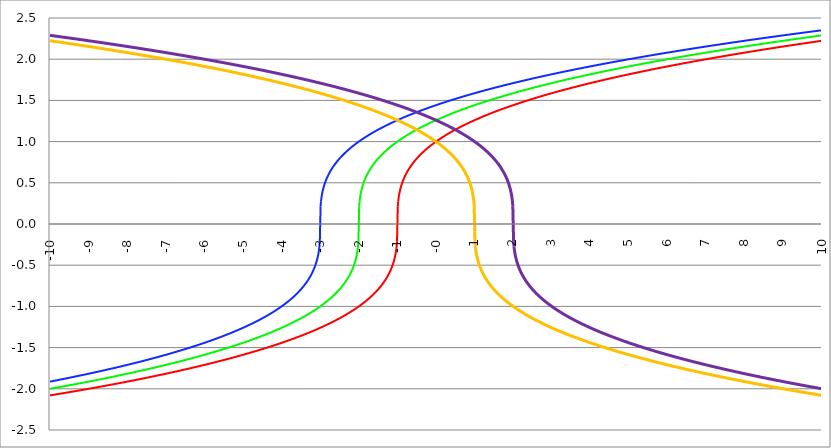
| Category | Series 1 | Series 0 | Series 2 | Series 3 | Series 4 |
|---|---|---|---|---|---|
| -10.0 | -2.08 | -2 | -1.913 | 2.224 | 2.289 |
| -9.99 | -2.079 | -1.999 | -1.912 | 2.223 | 2.289 |
| -9.98 | -2.079 | -1.998 | -1.911 | 2.223 | 2.288 |
| -9.97 | -2.078 | -1.997 | -1.91 | 2.222 | 2.288 |
| -9.96 | -2.077 | -1.997 | -1.909 | 2.221 | 2.287 |
| -9.95 | -2.076 | -1.996 | -1.908 | 2.221 | 2.286 |
| -9.940000000000001 | -2.075 | -1.995 | -1.907 | 2.22 | 2.286 |
| -9.930000000000001 | -2.075 | -1.994 | -1.907 | 2.219 | 2.285 |
| -9.920000000000002 | -2.074 | -1.993 | -1.906 | 2.219 | 2.284 |
| -9.91 | -2.073 | -1.992 | -1.905 | 2.218 | 2.284 |
| -9.900000000000002 | -2.072 | -1.992 | -1.904 | 2.217 | 2.283 |
| -9.890000000000002 | -2.072 | -1.991 | -1.903 | 2.217 | 2.282 |
| -9.880000000000003 | -2.071 | -1.99 | -1.902 | 2.216 | 2.282 |
| -9.870000000000003 | -2.07 | -1.989 | -1.901 | 2.215 | 2.281 |
| -9.860000000000001 | -2.069 | -1.988 | -1.9 | 2.215 | 2.28 |
| -9.850000000000003 | -2.068 | -1.987 | -1.899 | 2.214 | 2.28 |
| -9.840000000000003 | -2.068 | -1.987 | -1.898 | 2.213 | 2.279 |
| -9.830000000000004 | -2.067 | -1.986 | -1.897 | 2.212 | 2.279 |
| -9.820000000000004 | -2.066 | -1.985 | -1.896 | 2.212 | 2.278 |
| -9.810000000000004 | -2.065 | -1.984 | -1.895 | 2.211 | 2.277 |
| -9.800000000000004 | -2.065 | -1.983 | -1.895 | 2.21 | 2.277 |
| -9.790000000000004 | -2.064 | -1.982 | -1.894 | 2.21 | 2.276 |
| -9.780000000000005 | -2.063 | -1.981 | -1.893 | 2.209 | 2.275 |
| -9.770000000000005 | -2.062 | -1.981 | -1.892 | 2.208 | 2.275 |
| -9.760000000000005 | -2.061 | -1.98 | -1.891 | 2.208 | 2.274 |
| -9.750000000000005 | -2.061 | -1.979 | -1.89 | 2.207 | 2.273 |
| -9.740000000000006 | -2.06 | -1.978 | -1.889 | 2.206 | 2.273 |
| -9.730000000000006 | -2.059 | -1.977 | -1.888 | 2.206 | 2.272 |
| -9.720000000000006 | -2.058 | -1.976 | -1.887 | 2.205 | 2.271 |
| -9.710000000000006 | -2.057 | -1.976 | -1.886 | 2.204 | 2.271 |
| -9.700000000000006 | -2.057 | -1.975 | -1.885 | 2.204 | 2.27 |
| -9.690000000000007 | -2.056 | -1.974 | -1.884 | 2.203 | 2.27 |
| -9.680000000000007 | -2.055 | -1.973 | -1.883 | 2.202 | 2.269 |
| -9.670000000000007 | -2.054 | -1.972 | -1.882 | 2.202 | 2.268 |
| -9.660000000000007 | -2.054 | -1.971 | -1.881 | 2.201 | 2.268 |
| -9.650000000000007 | -2.053 | -1.97 | -1.881 | 2.2 | 2.267 |
| -9.640000000000008 | -2.052 | -1.97 | -1.88 | 2.199 | 2.266 |
| -9.630000000000008 | -2.051 | -1.969 | -1.879 | 2.199 | 2.266 |
| -9.620000000000008 | -2.05 | -1.968 | -1.878 | 2.198 | 2.265 |
| -9.610000000000008 | -2.05 | -1.967 | -1.877 | 2.197 | 2.264 |
| -9.600000000000009 | -2.049 | -1.966 | -1.876 | 2.197 | 2.264 |
| -9.590000000000009 | -2.048 | -1.965 | -1.875 | 2.196 | 2.263 |
| -9.580000000000007 | -2.047 | -1.964 | -1.874 | 2.195 | 2.262 |
| -9.57000000000001 | -2.046 | -1.964 | -1.873 | 2.195 | 2.262 |
| -9.56000000000001 | -2.046 | -1.963 | -1.872 | 2.194 | 2.261 |
| -9.55000000000001 | -2.045 | -1.962 | -1.871 | 2.193 | 2.26 |
| -9.54000000000001 | -2.044 | -1.961 | -1.87 | 2.193 | 2.26 |
| -9.53000000000001 | -2.043 | -1.96 | -1.869 | 2.192 | 2.259 |
| -9.52000000000001 | -2.042 | -1.959 | -1.868 | 2.191 | 2.258 |
| -9.51000000000001 | -2.042 | -1.958 | -1.867 | 2.19 | 2.258 |
| -9.50000000000001 | -2.041 | -1.957 | -1.866 | 2.19 | 2.257 |
| -9.49000000000001 | -2.04 | -1.957 | -1.865 | 2.189 | 2.257 |
| -9.48000000000001 | -2.039 | -1.956 | -1.864 | 2.188 | 2.256 |
| -9.47000000000001 | -2.038 | -1.955 | -1.863 | 2.188 | 2.255 |
| -9.46000000000001 | -2.038 | -1.954 | -1.862 | 2.187 | 2.255 |
| -9.45000000000001 | -2.037 | -1.953 | -1.861 | 2.186 | 2.254 |
| -9.44000000000001 | -2.036 | -1.952 | -1.86 | 2.186 | 2.253 |
| -9.430000000000012 | -2.035 | -1.951 | -1.86 | 2.185 | 2.253 |
| -9.420000000000012 | -2.034 | -1.95 | -1.859 | 2.184 | 2.252 |
| -9.410000000000013 | -2.034 | -1.95 | -1.858 | 2.183 | 2.251 |
| -9.400000000000013 | -2.033 | -1.949 | -1.857 | 2.183 | 2.251 |
| -9.390000000000011 | -2.032 | -1.948 | -1.856 | 2.182 | 2.25 |
| -9.380000000000013 | -2.031 | -1.947 | -1.855 | 2.181 | 2.249 |
| -9.370000000000013 | -2.03 | -1.946 | -1.854 | 2.181 | 2.249 |
| -9.360000000000014 | -2.03 | -1.945 | -1.853 | 2.18 | 2.248 |
| -9.350000000000014 | -2.029 | -1.944 | -1.852 | 2.179 | 2.247 |
| -9.340000000000014 | -2.028 | -1.943 | -1.851 | 2.179 | 2.247 |
| -9.330000000000014 | -2.027 | -1.943 | -1.85 | 2.178 | 2.246 |
| -9.320000000000014 | -2.026 | -1.942 | -1.849 | 2.177 | 2.245 |
| -9.310000000000015 | -2.026 | -1.941 | -1.848 | 2.176 | 2.245 |
| -9.300000000000013 | -2.025 | -1.94 | -1.847 | 2.176 | 2.244 |
| -9.290000000000015 | -2.024 | -1.939 | -1.846 | 2.175 | 2.243 |
| -9.280000000000015 | -2.023 | -1.938 | -1.845 | 2.174 | 2.243 |
| -9.270000000000016 | -2.022 | -1.937 | -1.844 | 2.174 | 2.242 |
| -9.260000000000016 | -2.021 | -1.936 | -1.843 | 2.173 | 2.241 |
| -9.250000000000014 | -2.021 | -1.935 | -1.842 | 2.172 | 2.241 |
| -9.240000000000016 | -2.02 | -1.935 | -1.841 | 2.172 | 2.24 |
| -9.230000000000016 | -2.019 | -1.934 | -1.84 | 2.171 | 2.239 |
| -9.220000000000017 | -2.018 | -1.933 | -1.839 | 2.17 | 2.239 |
| -9.210000000000017 | -2.017 | -1.932 | -1.838 | 2.169 | 2.238 |
| -9.200000000000017 | -2.017 | -1.931 | -1.837 | 2.169 | 2.237 |
| -9.190000000000017 | -2.016 | -1.93 | -1.836 | 2.168 | 2.237 |
| -9.180000000000017 | -2.015 | -1.929 | -1.835 | 2.167 | 2.236 |
| -9.170000000000018 | -2.014 | -1.928 | -1.834 | 2.167 | 2.235 |
| -9.160000000000016 | -2.013 | -1.927 | -1.833 | 2.166 | 2.235 |
| -9.150000000000018 | -2.012 | -1.926 | -1.832 | 2.165 | 2.234 |
| -9.140000000000018 | -2.012 | -1.926 | -1.831 | 2.164 | 2.233 |
| -9.130000000000019 | -2.011 | -1.925 | -1.83 | 2.164 | 2.233 |
| -9.120000000000019 | -2.01 | -1.924 | -1.829 | 2.163 | 2.232 |
| -9.110000000000017 | -2.009 | -1.923 | -1.828 | 2.162 | 2.231 |
| -9.10000000000002 | -2.008 | -1.922 | -1.827 | 2.162 | 2.231 |
| -9.09000000000002 | -2.007 | -1.921 | -1.826 | 2.161 | 2.23 |
| -9.08000000000002 | -2.007 | -1.92 | -1.825 | 2.16 | 2.229 |
| -9.07000000000002 | -2.006 | -1.919 | -1.824 | 2.159 | 2.229 |
| -9.06000000000002 | -2.005 | -1.918 | -1.823 | 2.159 | 2.228 |
| -9.05000000000002 | -2.004 | -1.917 | -1.822 | 2.158 | 2.227 |
| -9.04000000000002 | -2.003 | -1.917 | -1.821 | 2.157 | 2.227 |
| -9.03000000000002 | -2.002 | -1.916 | -1.82 | 2.157 | 2.226 |
| -9.020000000000021 | -2.002 | -1.915 | -1.819 | 2.156 | 2.225 |
| -9.010000000000021 | -2.001 | -1.914 | -1.818 | 2.155 | 2.225 |
| -9.000000000000021 | -2 | -1.913 | -1.817 | 2.154 | 2.224 |
| -8.990000000000022 | -1.999 | -1.912 | -1.816 | 2.154 | 2.223 |
| -8.980000000000022 | -1.998 | -1.911 | -1.815 | 2.153 | 2.223 |
| -8.97000000000002 | -1.997 | -1.91 | -1.814 | 2.152 | 2.222 |
| -8.960000000000022 | -1.997 | -1.909 | -1.813 | 2.152 | 2.221 |
| -8.950000000000022 | -1.996 | -1.908 | -1.812 | 2.151 | 2.221 |
| -8.940000000000023 | -1.995 | -1.907 | -1.811 | 2.15 | 2.22 |
| -8.930000000000023 | -1.994 | -1.907 | -1.81 | 2.149 | 2.219 |
| -8.920000000000023 | -1.993 | -1.906 | -1.809 | 2.149 | 2.219 |
| -8.910000000000023 | -1.992 | -1.905 | -1.808 | 2.148 | 2.218 |
| -8.900000000000023 | -1.992 | -1.904 | -1.807 | 2.147 | 2.217 |
| -8.890000000000024 | -1.991 | -1.903 | -1.806 | 2.147 | 2.217 |
| -8.880000000000024 | -1.99 | -1.902 | -1.805 | 2.146 | 2.216 |
| -8.870000000000024 | -1.989 | -1.901 | -1.804 | 2.145 | 2.215 |
| -8.860000000000024 | -1.988 | -1.9 | -1.803 | 2.144 | 2.215 |
| -8.850000000000025 | -1.987 | -1.899 | -1.802 | 2.144 | 2.214 |
| -8.840000000000025 | -1.987 | -1.898 | -1.801 | 2.143 | 2.213 |
| -8.830000000000025 | -1.986 | -1.897 | -1.8 | 2.142 | 2.212 |
| -8.820000000000025 | -1.985 | -1.896 | -1.799 | 2.141 | 2.212 |
| -8.810000000000025 | -1.984 | -1.895 | -1.798 | 2.141 | 2.211 |
| -8.800000000000026 | -1.983 | -1.895 | -1.797 | 2.14 | 2.21 |
| -8.790000000000026 | -1.982 | -1.894 | -1.796 | 2.139 | 2.21 |
| -8.780000000000026 | -1.981 | -1.893 | -1.795 | 2.139 | 2.209 |
| -8.770000000000026 | -1.981 | -1.892 | -1.794 | 2.138 | 2.208 |
| -8.760000000000026 | -1.98 | -1.891 | -1.793 | 2.137 | 2.208 |
| -8.750000000000027 | -1.979 | -1.89 | -1.792 | 2.136 | 2.207 |
| -8.740000000000027 | -1.978 | -1.889 | -1.79 | 2.136 | 2.206 |
| -8.730000000000027 | -1.977 | -1.888 | -1.789 | 2.135 | 2.206 |
| -8.720000000000027 | -1.976 | -1.887 | -1.788 | 2.134 | 2.205 |
| -8.710000000000027 | -1.976 | -1.886 | -1.787 | 2.133 | 2.204 |
| -8.700000000000028 | -1.975 | -1.885 | -1.786 | 2.133 | 2.204 |
| -8.690000000000028 | -1.974 | -1.884 | -1.785 | 2.132 | 2.203 |
| -8.680000000000028 | -1.973 | -1.883 | -1.784 | 2.131 | 2.202 |
| -8.670000000000028 | -1.972 | -1.882 | -1.783 | 2.13 | 2.202 |
| -8.660000000000029 | -1.971 | -1.881 | -1.782 | 2.13 | 2.201 |
| -8.650000000000029 | -1.97 | -1.881 | -1.781 | 2.129 | 2.2 |
| -8.640000000000029 | -1.97 | -1.88 | -1.78 | 2.128 | 2.199 |
| -8.63000000000003 | -1.969 | -1.879 | -1.779 | 2.128 | 2.199 |
| -8.62000000000003 | -1.968 | -1.878 | -1.778 | 2.127 | 2.198 |
| -8.61000000000003 | -1.967 | -1.877 | -1.777 | 2.126 | 2.197 |
| -8.60000000000003 | -1.966 | -1.876 | -1.776 | 2.125 | 2.197 |
| -8.59000000000003 | -1.965 | -1.875 | -1.775 | 2.125 | 2.196 |
| -8.58000000000003 | -1.964 | -1.874 | -1.774 | 2.124 | 2.195 |
| -8.57000000000003 | -1.964 | -1.873 | -1.773 | 2.123 | 2.195 |
| -8.56000000000003 | -1.963 | -1.872 | -1.772 | 2.122 | 2.194 |
| -8.55000000000003 | -1.962 | -1.871 | -1.771 | 2.122 | 2.193 |
| -8.540000000000031 | -1.961 | -1.87 | -1.769 | 2.121 | 2.193 |
| -8.530000000000031 | -1.96 | -1.869 | -1.768 | 2.12 | 2.192 |
| -8.520000000000032 | -1.959 | -1.868 | -1.767 | 2.119 | 2.191 |
| -8.510000000000032 | -1.958 | -1.867 | -1.766 | 2.119 | 2.19 |
| -8.50000000000003 | -1.957 | -1.866 | -1.765 | 2.118 | 2.19 |
| -8.490000000000032 | -1.957 | -1.865 | -1.764 | 2.117 | 2.189 |
| -8.480000000000032 | -1.956 | -1.864 | -1.763 | 2.116 | 2.188 |
| -8.470000000000033 | -1.955 | -1.863 | -1.762 | 2.116 | 2.188 |
| -8.460000000000033 | -1.954 | -1.862 | -1.761 | 2.115 | 2.187 |
| -8.450000000000033 | -1.953 | -1.861 | -1.76 | 2.114 | 2.186 |
| -8.440000000000033 | -1.952 | -1.86 | -1.759 | 2.113 | 2.186 |
| -8.430000000000033 | -1.951 | -1.86 | -1.758 | 2.113 | 2.185 |
| -8.420000000000034 | -1.95 | -1.859 | -1.757 | 2.112 | 2.184 |
| -8.410000000000032 | -1.95 | -1.858 | -1.755 | 2.111 | 2.183 |
| -8.400000000000034 | -1.949 | -1.857 | -1.754 | 2.11 | 2.183 |
| -8.390000000000034 | -1.948 | -1.856 | -1.753 | 2.11 | 2.182 |
| -8.380000000000035 | -1.947 | -1.855 | -1.752 | 2.109 | 2.181 |
| -8.370000000000035 | -1.946 | -1.854 | -1.751 | 2.108 | 2.181 |
| -8.360000000000033 | -1.945 | -1.853 | -1.75 | 2.107 | 2.18 |
| -8.350000000000035 | -1.944 | -1.852 | -1.749 | 2.107 | 2.179 |
| -8.340000000000035 | -1.943 | -1.851 | -1.748 | 2.106 | 2.179 |
| -8.330000000000036 | -1.943 | -1.85 | -1.747 | 2.105 | 2.178 |
| -8.320000000000036 | -1.942 | -1.849 | -1.746 | 2.104 | 2.177 |
| -8.310000000000034 | -1.941 | -1.848 | -1.745 | 2.104 | 2.176 |
| -8.300000000000036 | -1.94 | -1.847 | -1.744 | 2.103 | 2.176 |
| -8.290000000000036 | -1.939 | -1.846 | -1.742 | 2.102 | 2.175 |
| -8.280000000000037 | -1.938 | -1.845 | -1.741 | 2.101 | 2.174 |
| -8.270000000000037 | -1.937 | -1.844 | -1.74 | 2.101 | 2.174 |
| -8.260000000000037 | -1.936 | -1.843 | -1.739 | 2.1 | 2.173 |
| -8.250000000000037 | -1.935 | -1.842 | -1.738 | 2.099 | 2.172 |
| -8.240000000000038 | -1.935 | -1.841 | -1.737 | 2.098 | 2.172 |
| -8.230000000000038 | -1.934 | -1.84 | -1.736 | 2.098 | 2.171 |
| -8.220000000000038 | -1.933 | -1.839 | -1.735 | 2.097 | 2.17 |
| -8.210000000000038 | -1.932 | -1.838 | -1.734 | 2.096 | 2.169 |
| -8.200000000000038 | -1.931 | -1.837 | -1.732 | 2.095 | 2.169 |
| -8.190000000000039 | -1.93 | -1.836 | -1.731 | 2.095 | 2.168 |
| -8.180000000000039 | -1.929 | -1.835 | -1.73 | 2.094 | 2.167 |
| -8.170000000000037 | -1.928 | -1.834 | -1.729 | 2.093 | 2.167 |
| -8.16000000000004 | -1.927 | -1.833 | -1.728 | 2.092 | 2.166 |
| -8.15000000000004 | -1.926 | -1.832 | -1.727 | 2.092 | 2.165 |
| -8.14000000000004 | -1.926 | -1.831 | -1.726 | 2.091 | 2.164 |
| -8.13000000000004 | -1.925 | -1.83 | -1.725 | 2.09 | 2.164 |
| -8.12000000000004 | -1.924 | -1.829 | -1.724 | 2.089 | 2.163 |
| -8.11000000000004 | -1.923 | -1.828 | -1.722 | 2.089 | 2.162 |
| -8.10000000000004 | -1.922 | -1.827 | -1.721 | 2.088 | 2.162 |
| -8.09000000000004 | -1.921 | -1.826 | -1.72 | 2.087 | 2.161 |
| -8.08000000000004 | -1.92 | -1.825 | -1.719 | 2.086 | 2.16 |
| -8.07000000000004 | -1.919 | -1.824 | -1.718 | 2.085 | 2.159 |
| -8.06000000000004 | -1.918 | -1.823 | -1.717 | 2.085 | 2.159 |
| -8.05000000000004 | -1.917 | -1.822 | -1.716 | 2.084 | 2.158 |
| -8.040000000000042 | -1.917 | -1.821 | -1.715 | 2.083 | 2.157 |
| -8.03000000000004 | -1.916 | -1.82 | -1.713 | 2.082 | 2.157 |
| -8.020000000000042 | -1.915 | -1.819 | -1.712 | 2.082 | 2.156 |
| -8.010000000000042 | -1.914 | -1.818 | -1.711 | 2.081 | 2.155 |
| -8.000000000000043 | -1.913 | -1.817 | -1.71 | 2.08 | 2.154 |
| -7.990000000000043 | -1.912 | -1.816 | -1.709 | 2.079 | 2.154 |
| -7.980000000000043 | -1.911 | -1.815 | -1.708 | 2.079 | 2.153 |
| -7.970000000000043 | -1.91 | -1.814 | -1.707 | 2.078 | 2.152 |
| -7.960000000000043 | -1.909 | -1.813 | -1.705 | 2.077 | 2.152 |
| -7.950000000000044 | -1.908 | -1.812 | -1.704 | 2.076 | 2.151 |
| -7.940000000000044 | -1.907 | -1.811 | -1.703 | 2.075 | 2.15 |
| -7.930000000000044 | -1.907 | -1.81 | -1.702 | 2.075 | 2.149 |
| -7.920000000000044 | -1.906 | -1.809 | -1.701 | 2.074 | 2.149 |
| -7.910000000000044 | -1.905 | -1.808 | -1.7 | 2.073 | 2.148 |
| -7.900000000000044 | -1.904 | -1.807 | -1.698 | 2.072 | 2.147 |
| -7.890000000000045 | -1.903 | -1.806 | -1.697 | 2.072 | 2.147 |
| -7.880000000000045 | -1.902 | -1.805 | -1.696 | 2.071 | 2.146 |
| -7.870000000000045 | -1.901 | -1.804 | -1.695 | 2.07 | 2.145 |
| -7.860000000000046 | -1.9 | -1.803 | -1.694 | 2.069 | 2.144 |
| -7.850000000000046 | -1.899 | -1.802 | -1.693 | 2.068 | 2.144 |
| -7.840000000000046 | -1.898 | -1.801 | -1.692 | 2.068 | 2.143 |
| -7.830000000000046 | -1.897 | -1.8 | -1.69 | 2.067 | 2.142 |
| -7.820000000000046 | -1.896 | -1.799 | -1.689 | 2.066 | 2.141 |
| -7.810000000000047 | -1.895 | -1.798 | -1.688 | 2.065 | 2.141 |
| -7.800000000000047 | -1.895 | -1.797 | -1.687 | 2.065 | 2.14 |
| -7.790000000000047 | -1.894 | -1.796 | -1.686 | 2.064 | 2.139 |
| -7.780000000000047 | -1.893 | -1.795 | -1.685 | 2.063 | 2.139 |
| -7.770000000000047 | -1.892 | -1.794 | -1.683 | 2.062 | 2.138 |
| -7.760000000000048 | -1.891 | -1.793 | -1.682 | 2.061 | 2.137 |
| -7.750000000000048 | -1.89 | -1.792 | -1.681 | 2.061 | 2.136 |
| -7.740000000000048 | -1.889 | -1.79 | -1.68 | 2.06 | 2.136 |
| -7.730000000000048 | -1.888 | -1.789 | -1.679 | 2.059 | 2.135 |
| -7.720000000000049 | -1.887 | -1.788 | -1.677 | 2.058 | 2.134 |
| -7.710000000000049 | -1.886 | -1.787 | -1.676 | 2.057 | 2.133 |
| -7.700000000000049 | -1.885 | -1.786 | -1.675 | 2.057 | 2.133 |
| -7.690000000000049 | -1.884 | -1.785 | -1.674 | 2.056 | 2.132 |
| -7.680000000000049 | -1.883 | -1.784 | -1.673 | 2.055 | 2.131 |
| -7.67000000000005 | -1.882 | -1.783 | -1.671 | 2.054 | 2.13 |
| -7.66000000000005 | -1.881 | -1.782 | -1.67 | 2.054 | 2.13 |
| -7.65000000000005 | -1.881 | -1.781 | -1.669 | 2.053 | 2.129 |
| -7.64000000000005 | -1.88 | -1.78 | -1.668 | 2.052 | 2.128 |
| -7.63000000000005 | -1.879 | -1.779 | -1.667 | 2.051 | 2.128 |
| -7.620000000000051 | -1.878 | -1.778 | -1.666 | 2.05 | 2.127 |
| -7.610000000000051 | -1.877 | -1.777 | -1.664 | 2.05 | 2.126 |
| -7.600000000000051 | -1.876 | -1.776 | -1.663 | 2.049 | 2.125 |
| -7.590000000000051 | -1.875 | -1.775 | -1.662 | 2.048 | 2.125 |
| -7.580000000000052 | -1.874 | -1.774 | -1.661 | 2.047 | 2.124 |
| -7.570000000000052 | -1.873 | -1.773 | -1.659 | 2.046 | 2.123 |
| -7.560000000000052 | -1.872 | -1.772 | -1.658 | 2.046 | 2.122 |
| -7.550000000000052 | -1.871 | -1.771 | -1.657 | 2.045 | 2.122 |
| -7.540000000000052 | -1.87 | -1.769 | -1.656 | 2.044 | 2.121 |
| -7.530000000000053 | -1.869 | -1.768 | -1.655 | 2.043 | 2.12 |
| -7.520000000000053 | -1.868 | -1.767 | -1.653 | 2.042 | 2.119 |
| -7.510000000000053 | -1.867 | -1.766 | -1.652 | 2.042 | 2.119 |
| -7.500000000000053 | -1.866 | -1.765 | -1.651 | 2.041 | 2.118 |
| -7.490000000000053 | -1.865 | -1.764 | -1.65 | 2.04 | 2.117 |
| -7.480000000000054 | -1.864 | -1.763 | -1.649 | 2.039 | 2.116 |
| -7.470000000000054 | -1.863 | -1.762 | -1.647 | 2.038 | 2.116 |
| -7.460000000000054 | -1.862 | -1.761 | -1.646 | 2.038 | 2.115 |
| -7.450000000000054 | -1.861 | -1.76 | -1.645 | 2.037 | 2.114 |
| -7.440000000000054 | -1.86 | -1.759 | -1.644 | 2.036 | 2.113 |
| -7.430000000000054 | -1.86 | -1.758 | -1.642 | 2.035 | 2.113 |
| -7.420000000000055 | -1.859 | -1.757 | -1.641 | 2.034 | 2.112 |
| -7.410000000000055 | -1.858 | -1.755 | -1.64 | 2.034 | 2.111 |
| -7.400000000000055 | -1.857 | -1.754 | -1.639 | 2.033 | 2.11 |
| -7.390000000000056 | -1.856 | -1.753 | -1.637 | 2.032 | 2.11 |
| -7.380000000000056 | -1.855 | -1.752 | -1.636 | 2.031 | 2.109 |
| -7.370000000000056 | -1.854 | -1.751 | -1.635 | 2.03 | 2.108 |
| -7.360000000000056 | -1.853 | -1.75 | -1.634 | 2.03 | 2.107 |
| -7.350000000000056 | -1.852 | -1.749 | -1.632 | 2.029 | 2.107 |
| -7.340000000000057 | -1.851 | -1.748 | -1.631 | 2.028 | 2.106 |
| -7.330000000000057 | -1.85 | -1.747 | -1.63 | 2.027 | 2.105 |
| -7.320000000000057 | -1.849 | -1.746 | -1.629 | 2.026 | 2.104 |
| -7.310000000000057 | -1.848 | -1.745 | -1.627 | 2.026 | 2.104 |
| -7.300000000000058 | -1.847 | -1.744 | -1.626 | 2.025 | 2.103 |
| -7.290000000000058 | -1.846 | -1.742 | -1.625 | 2.024 | 2.102 |
| -7.280000000000058 | -1.845 | -1.741 | -1.624 | 2.023 | 2.101 |
| -7.270000000000058 | -1.844 | -1.74 | -1.622 | 2.022 | 2.101 |
| -7.260000000000058 | -1.843 | -1.739 | -1.621 | 2.021 | 2.1 |
| -7.250000000000059 | -1.842 | -1.738 | -1.62 | 2.021 | 2.099 |
| -7.240000000000059 | -1.841 | -1.737 | -1.619 | 2.02 | 2.098 |
| -7.23000000000006 | -1.84 | -1.736 | -1.617 | 2.019 | 2.098 |
| -7.220000000000059 | -1.839 | -1.735 | -1.616 | 2.018 | 2.097 |
| -7.210000000000059 | -1.838 | -1.734 | -1.615 | 2.017 | 2.096 |
| -7.20000000000006 | -1.837 | -1.732 | -1.613 | 2.017 | 2.095 |
| -7.19000000000006 | -1.836 | -1.731 | -1.612 | 2.016 | 2.095 |
| -7.18000000000006 | -1.835 | -1.73 | -1.611 | 2.015 | 2.094 |
| -7.17000000000006 | -1.834 | -1.729 | -1.61 | 2.014 | 2.093 |
| -7.160000000000061 | -1.833 | -1.728 | -1.608 | 2.013 | 2.092 |
| -7.150000000000061 | -1.832 | -1.727 | -1.607 | 2.012 | 2.092 |
| -7.140000000000061 | -1.831 | -1.726 | -1.606 | 2.012 | 2.091 |
| -7.130000000000061 | -1.83 | -1.725 | -1.604 | 2.011 | 2.09 |
| -7.120000000000061 | -1.829 | -1.724 | -1.603 | 2.01 | 2.089 |
| -7.110000000000062 | -1.828 | -1.722 | -1.602 | 2.009 | 2.089 |
| -7.100000000000062 | -1.827 | -1.721 | -1.601 | 2.008 | 2.088 |
| -7.090000000000062 | -1.826 | -1.72 | -1.599 | 2.007 | 2.087 |
| -7.080000000000062 | -1.825 | -1.719 | -1.598 | 2.007 | 2.086 |
| -7.070000000000062 | -1.824 | -1.718 | -1.597 | 2.006 | 2.085 |
| -7.060000000000063 | -1.823 | -1.717 | -1.595 | 2.005 | 2.085 |
| -7.050000000000063 | -1.822 | -1.716 | -1.594 | 2.004 | 2.084 |
| -7.040000000000063 | -1.821 | -1.715 | -1.593 | 2.003 | 2.083 |
| -7.030000000000063 | -1.82 | -1.713 | -1.591 | 2.002 | 2.082 |
| -7.020000000000064 | -1.819 | -1.712 | -1.59 | 2.002 | 2.082 |
| -7.010000000000064 | -1.818 | -1.711 | -1.589 | 2.001 | 2.081 |
| -7.000000000000064 | -1.817 | -1.71 | -1.587 | 2 | 2.08 |
| -6.990000000000064 | -1.816 | -1.709 | -1.586 | 1.999 | 2.079 |
| -6.980000000000064 | -1.815 | -1.708 | -1.585 | 1.998 | 2.079 |
| -6.970000000000064 | -1.814 | -1.707 | -1.583 | 1.997 | 2.078 |
| -6.960000000000064 | -1.813 | -1.705 | -1.582 | 1.997 | 2.077 |
| -6.950000000000064 | -1.812 | -1.704 | -1.581 | 1.996 | 2.076 |
| -6.940000000000065 | -1.811 | -1.703 | -1.579 | 1.995 | 2.075 |
| -6.930000000000065 | -1.81 | -1.702 | -1.578 | 1.994 | 2.075 |
| -6.920000000000065 | -1.809 | -1.701 | -1.577 | 1.993 | 2.074 |
| -6.910000000000065 | -1.808 | -1.7 | -1.575 | 1.992 | 2.073 |
| -6.900000000000066 | -1.807 | -1.698 | -1.574 | 1.992 | 2.072 |
| -6.890000000000066 | -1.806 | -1.697 | -1.573 | 1.991 | 2.072 |
| -6.880000000000066 | -1.805 | -1.696 | -1.571 | 1.99 | 2.071 |
| -6.870000000000066 | -1.804 | -1.695 | -1.57 | 1.989 | 2.07 |
| -6.860000000000067 | -1.803 | -1.694 | -1.569 | 1.988 | 2.069 |
| -6.850000000000067 | -1.802 | -1.693 | -1.567 | 1.987 | 2.068 |
| -6.840000000000067 | -1.801 | -1.692 | -1.566 | 1.987 | 2.068 |
| -6.830000000000067 | -1.8 | -1.69 | -1.565 | 1.986 | 2.067 |
| -6.820000000000068 | -1.799 | -1.689 | -1.563 | 1.985 | 2.066 |
| -6.810000000000068 | -1.798 | -1.688 | -1.562 | 1.984 | 2.065 |
| -6.800000000000068 | -1.797 | -1.687 | -1.56 | 1.983 | 2.065 |
| -6.790000000000068 | -1.796 | -1.686 | -1.559 | 1.982 | 2.064 |
| -6.780000000000068 | -1.795 | -1.685 | -1.558 | 1.981 | 2.063 |
| -6.770000000000068 | -1.794 | -1.683 | -1.556 | 1.981 | 2.062 |
| -6.760000000000069 | -1.793 | -1.682 | -1.555 | 1.98 | 2.061 |
| -6.75000000000007 | -1.792 | -1.681 | -1.554 | 1.979 | 2.061 |
| -6.74000000000007 | -1.79 | -1.68 | -1.552 | 1.978 | 2.06 |
| -6.73000000000007 | -1.789 | -1.679 | -1.551 | 1.977 | 2.059 |
| -6.72000000000007 | -1.788 | -1.677 | -1.549 | 1.976 | 2.058 |
| -6.71000000000007 | -1.787 | -1.676 | -1.548 | 1.976 | 2.057 |
| -6.70000000000007 | -1.786 | -1.675 | -1.547 | 1.975 | 2.057 |
| -6.69000000000007 | -1.785 | -1.674 | -1.545 | 1.974 | 2.056 |
| -6.680000000000071 | -1.784 | -1.673 | -1.544 | 1.973 | 2.055 |
| -6.670000000000071 | -1.783 | -1.671 | -1.542 | 1.972 | 2.054 |
| -6.660000000000071 | -1.782 | -1.67 | -1.541 | 1.971 | 2.054 |
| -6.650000000000071 | -1.781 | -1.669 | -1.54 | 1.97 | 2.053 |
| -6.640000000000072 | -1.78 | -1.668 | -1.538 | 1.97 | 2.052 |
| -6.630000000000072 | -1.779 | -1.667 | -1.537 | 1.969 | 2.051 |
| -6.620000000000072 | -1.778 | -1.666 | -1.535 | 1.968 | 2.05 |
| -6.610000000000072 | -1.777 | -1.664 | -1.534 | 1.967 | 2.05 |
| -6.600000000000072 | -1.776 | -1.663 | -1.533 | 1.966 | 2.049 |
| -6.590000000000073 | -1.775 | -1.662 | -1.531 | 1.965 | 2.048 |
| -6.580000000000073 | -1.774 | -1.661 | -1.53 | 1.964 | 2.047 |
| -6.570000000000073 | -1.773 | -1.659 | -1.528 | 1.964 | 2.046 |
| -6.560000000000073 | -1.772 | -1.658 | -1.527 | 1.963 | 2.046 |
| -6.550000000000074 | -1.771 | -1.657 | -1.525 | 1.962 | 2.045 |
| -6.540000000000074 | -1.769 | -1.656 | -1.524 | 1.961 | 2.044 |
| -6.530000000000074 | -1.768 | -1.655 | -1.523 | 1.96 | 2.043 |
| -6.520000000000074 | -1.767 | -1.653 | -1.521 | 1.959 | 2.042 |
| -6.510000000000074 | -1.766 | -1.652 | -1.52 | 1.958 | 2.042 |
| -6.500000000000074 | -1.765 | -1.651 | -1.518 | 1.957 | 2.041 |
| -6.490000000000074 | -1.764 | -1.65 | -1.517 | 1.957 | 2.04 |
| -6.480000000000074 | -1.763 | -1.649 | -1.515 | 1.956 | 2.039 |
| -6.470000000000075 | -1.762 | -1.647 | -1.514 | 1.955 | 2.038 |
| -6.460000000000075 | -1.761 | -1.646 | -1.512 | 1.954 | 2.038 |
| -6.450000000000075 | -1.76 | -1.645 | -1.511 | 1.953 | 2.037 |
| -6.440000000000075 | -1.759 | -1.644 | -1.51 | 1.952 | 2.036 |
| -6.430000000000076 | -1.758 | -1.642 | -1.508 | 1.951 | 2.035 |
| -6.420000000000076 | -1.757 | -1.641 | -1.507 | 1.95 | 2.034 |
| -6.410000000000076 | -1.755 | -1.64 | -1.505 | 1.95 | 2.034 |
| -6.400000000000076 | -1.754 | -1.639 | -1.504 | 1.949 | 2.033 |
| -6.390000000000077 | -1.753 | -1.637 | -1.502 | 1.948 | 2.032 |
| -6.380000000000077 | -1.752 | -1.636 | -1.501 | 1.947 | 2.031 |
| -6.370000000000077 | -1.751 | -1.635 | -1.499 | 1.946 | 2.03 |
| -6.360000000000078 | -1.75 | -1.634 | -1.498 | 1.945 | 2.03 |
| -6.350000000000078 | -1.749 | -1.632 | -1.496 | 1.944 | 2.029 |
| -6.340000000000078 | -1.748 | -1.631 | -1.495 | 1.943 | 2.028 |
| -6.330000000000078 | -1.747 | -1.63 | -1.493 | 1.943 | 2.027 |
| -6.320000000000078 | -1.746 | -1.629 | -1.492 | 1.942 | 2.026 |
| -6.310000000000079 | -1.745 | -1.627 | -1.49 | 1.941 | 2.026 |
| -6.300000000000079 | -1.744 | -1.626 | -1.489 | 1.94 | 2.025 |
| -6.29000000000008 | -1.742 | -1.625 | -1.487 | 1.939 | 2.024 |
| -6.28000000000008 | -1.741 | -1.624 | -1.486 | 1.938 | 2.023 |
| -6.27000000000008 | -1.74 | -1.622 | -1.484 | 1.937 | 2.022 |
| -6.26000000000008 | -1.739 | -1.621 | -1.483 | 1.936 | 2.021 |
| -6.25000000000008 | -1.738 | -1.62 | -1.481 | 1.935 | 2.021 |
| -6.24000000000008 | -1.737 | -1.619 | -1.48 | 1.935 | 2.02 |
| -6.23000000000008 | -1.736 | -1.617 | -1.478 | 1.934 | 2.019 |
| -6.220000000000081 | -1.735 | -1.616 | -1.477 | 1.933 | 2.018 |
| -6.210000000000081 | -1.734 | -1.615 | -1.475 | 1.932 | 2.017 |
| -6.200000000000081 | -1.732 | -1.613 | -1.474 | 1.931 | 2.017 |
| -6.190000000000081 | -1.731 | -1.612 | -1.472 | 1.93 | 2.016 |
| -6.180000000000081 | -1.73 | -1.611 | -1.471 | 1.929 | 2.015 |
| -6.170000000000082 | -1.729 | -1.61 | -1.469 | 1.928 | 2.014 |
| -6.160000000000082 | -1.728 | -1.608 | -1.467 | 1.927 | 2.013 |
| -6.150000000000082 | -1.727 | -1.607 | -1.466 | 1.926 | 2.012 |
| -6.140000000000082 | -1.726 | -1.606 | -1.464 | 1.926 | 2.012 |
| -6.130000000000082 | -1.725 | -1.604 | -1.463 | 1.925 | 2.011 |
| -6.120000000000083 | -1.724 | -1.603 | -1.461 | 1.924 | 2.01 |
| -6.110000000000083 | -1.722 | -1.602 | -1.46 | 1.923 | 2.009 |
| -6.100000000000083 | -1.721 | -1.601 | -1.458 | 1.922 | 2.008 |
| -6.090000000000083 | -1.72 | -1.599 | -1.457 | 1.921 | 2.007 |
| -6.080000000000084 | -1.719 | -1.598 | -1.455 | 1.92 | 2.007 |
| -6.070000000000084 | -1.718 | -1.597 | -1.453 | 1.919 | 2.006 |
| -6.060000000000084 | -1.717 | -1.595 | -1.452 | 1.918 | 2.005 |
| -6.050000000000084 | -1.716 | -1.594 | -1.45 | 1.917 | 2.004 |
| -6.040000000000084 | -1.715 | -1.593 | -1.449 | 1.917 | 2.003 |
| -6.030000000000084 | -1.713 | -1.591 | -1.447 | 1.916 | 2.002 |
| -6.020000000000085 | -1.712 | -1.59 | -1.445 | 1.915 | 2.002 |
| -6.010000000000085 | -1.711 | -1.589 | -1.444 | 1.914 | 2.001 |
| -6.000000000000085 | -1.71 | -1.587 | -1.442 | 1.913 | 2 |
| -5.990000000000085 | -1.709 | -1.586 | -1.441 | 1.912 | 1.999 |
| -5.980000000000085 | -1.708 | -1.585 | -1.439 | 1.911 | 1.998 |
| -5.970000000000085 | -1.707 | -1.583 | -1.437 | 1.91 | 1.997 |
| -5.960000000000086 | -1.705 | -1.582 | -1.436 | 1.909 | 1.997 |
| -5.950000000000086 | -1.704 | -1.581 | -1.434 | 1.908 | 1.996 |
| -5.940000000000086 | -1.703 | -1.579 | -1.433 | 1.907 | 1.995 |
| -5.930000000000086 | -1.702 | -1.578 | -1.431 | 1.907 | 1.994 |
| -5.920000000000087 | -1.701 | -1.577 | -1.429 | 1.906 | 1.993 |
| -5.910000000000087 | -1.7 | -1.575 | -1.428 | 1.905 | 1.992 |
| -5.900000000000087 | -1.698 | -1.574 | -1.426 | 1.904 | 1.992 |
| -5.890000000000088 | -1.697 | -1.573 | -1.424 | 1.903 | 1.991 |
| -5.880000000000088 | -1.696 | -1.571 | -1.423 | 1.902 | 1.99 |
| -5.870000000000088 | -1.695 | -1.57 | -1.421 | 1.901 | 1.989 |
| -5.860000000000088 | -1.694 | -1.569 | -1.419 | 1.9 | 1.988 |
| -5.850000000000088 | -1.693 | -1.567 | -1.418 | 1.899 | 1.987 |
| -5.840000000000089 | -1.692 | -1.566 | -1.416 | 1.898 | 1.987 |
| -5.830000000000089 | -1.69 | -1.565 | -1.414 | 1.897 | 1.986 |
| -5.820000000000089 | -1.689 | -1.563 | -1.413 | 1.896 | 1.985 |
| -5.810000000000089 | -1.688 | -1.562 | -1.411 | 1.895 | 1.984 |
| -5.800000000000089 | -1.687 | -1.56 | -1.409 | 1.895 | 1.983 |
| -5.79000000000009 | -1.686 | -1.559 | -1.408 | 1.894 | 1.982 |
| -5.78000000000009 | -1.685 | -1.558 | -1.406 | 1.893 | 1.981 |
| -5.77000000000009 | -1.683 | -1.556 | -1.404 | 1.892 | 1.981 |
| -5.76000000000009 | -1.682 | -1.555 | -1.403 | 1.891 | 1.98 |
| -5.750000000000091 | -1.681 | -1.554 | -1.401 | 1.89 | 1.979 |
| -5.740000000000091 | -1.68 | -1.552 | -1.399 | 1.889 | 1.978 |
| -5.730000000000091 | -1.679 | -1.551 | -1.398 | 1.888 | 1.977 |
| -5.720000000000091 | -1.677 | -1.549 | -1.396 | 1.887 | 1.976 |
| -5.710000000000091 | -1.676 | -1.548 | -1.394 | 1.886 | 1.976 |
| -5.700000000000092 | -1.675 | -1.547 | -1.392 | 1.885 | 1.975 |
| -5.690000000000092 | -1.674 | -1.545 | -1.391 | 1.884 | 1.974 |
| -5.680000000000092 | -1.673 | -1.544 | -1.389 | 1.883 | 1.973 |
| -5.670000000000092 | -1.671 | -1.542 | -1.387 | 1.882 | 1.972 |
| -5.660000000000092 | -1.67 | -1.541 | -1.386 | 1.881 | 1.971 |
| -5.650000000000093 | -1.669 | -1.54 | -1.384 | 1.881 | 1.97 |
| -5.640000000000093 | -1.668 | -1.538 | -1.382 | 1.88 | 1.97 |
| -5.630000000000093 | -1.667 | -1.537 | -1.38 | 1.879 | 1.969 |
| -5.620000000000093 | -1.666 | -1.535 | -1.379 | 1.878 | 1.968 |
| -5.610000000000093 | -1.664 | -1.534 | -1.377 | 1.877 | 1.967 |
| -5.600000000000094 | -1.663 | -1.533 | -1.375 | 1.876 | 1.966 |
| -5.590000000000094 | -1.662 | -1.531 | -1.373 | 1.875 | 1.965 |
| -5.580000000000094 | -1.661 | -1.53 | -1.372 | 1.874 | 1.964 |
| -5.570000000000094 | -1.659 | -1.528 | -1.37 | 1.873 | 1.964 |
| -5.560000000000095 | -1.658 | -1.527 | -1.368 | 1.872 | 1.963 |
| -5.550000000000095 | -1.657 | -1.525 | -1.366 | 1.871 | 1.962 |
| -5.540000000000095 | -1.656 | -1.524 | -1.364 | 1.87 | 1.961 |
| -5.530000000000095 | -1.655 | -1.523 | -1.363 | 1.869 | 1.96 |
| -5.520000000000095 | -1.653 | -1.521 | -1.361 | 1.868 | 1.959 |
| -5.510000000000096 | -1.652 | -1.52 | -1.359 | 1.867 | 1.958 |
| -5.500000000000096 | -1.651 | -1.518 | -1.357 | 1.866 | 1.957 |
| -5.490000000000096 | -1.65 | -1.517 | -1.355 | 1.865 | 1.957 |
| -5.480000000000096 | -1.649 | -1.515 | -1.354 | 1.864 | 1.956 |
| -5.470000000000096 | -1.647 | -1.514 | -1.352 | 1.863 | 1.955 |
| -5.460000000000097 | -1.646 | -1.512 | -1.35 | 1.862 | 1.954 |
| -5.450000000000097 | -1.645 | -1.511 | -1.348 | 1.861 | 1.953 |
| -5.440000000000097 | -1.644 | -1.51 | -1.346 | 1.86 | 1.952 |
| -5.430000000000097 | -1.642 | -1.508 | -1.344 | 1.86 | 1.951 |
| -5.420000000000098 | -1.641 | -1.507 | -1.343 | 1.859 | 1.95 |
| -5.410000000000098 | -1.64 | -1.505 | -1.341 | 1.858 | 1.95 |
| -5.400000000000098 | -1.639 | -1.504 | -1.339 | 1.857 | 1.949 |
| -5.390000000000098 | -1.637 | -1.502 | -1.337 | 1.856 | 1.948 |
| -5.380000000000098 | -1.636 | -1.501 | -1.335 | 1.855 | 1.947 |
| -5.370000000000099 | -1.635 | -1.499 | -1.333 | 1.854 | 1.946 |
| -5.360000000000099 | -1.634 | -1.498 | -1.331 | 1.853 | 1.945 |
| -5.350000000000099 | -1.632 | -1.496 | -1.33 | 1.852 | 1.944 |
| -5.340000000000099 | -1.631 | -1.495 | -1.328 | 1.851 | 1.943 |
| -5.330000000000099 | -1.63 | -1.493 | -1.326 | 1.85 | 1.943 |
| -5.3200000000001 | -1.629 | -1.492 | -1.324 | 1.849 | 1.942 |
| -5.3100000000001 | -1.627 | -1.49 | -1.322 | 1.848 | 1.941 |
| -5.3000000000001 | -1.626 | -1.489 | -1.32 | 1.847 | 1.94 |
| -5.2900000000001 | -1.625 | -1.487 | -1.318 | 1.846 | 1.939 |
| -5.2800000000001 | -1.624 | -1.486 | -1.316 | 1.845 | 1.938 |
| -5.2700000000001 | -1.622 | -1.484 | -1.314 | 1.844 | 1.937 |
| -5.260000000000101 | -1.621 | -1.483 | -1.312 | 1.843 | 1.936 |
| -5.250000000000101 | -1.62 | -1.481 | -1.31 | 1.842 | 1.935 |
| -5.240000000000101 | -1.619 | -1.48 | -1.308 | 1.841 | 1.935 |
| -5.230000000000101 | -1.617 | -1.478 | -1.306 | 1.84 | 1.934 |
| -5.220000000000102 | -1.616 | -1.477 | -1.305 | 1.839 | 1.933 |
| -5.210000000000102 | -1.615 | -1.475 | -1.303 | 1.838 | 1.932 |
| -5.200000000000102 | -1.613 | -1.474 | -1.301 | 1.837 | 1.931 |
| -5.190000000000103 | -1.612 | -1.472 | -1.299 | 1.836 | 1.93 |
| -5.180000000000103 | -1.611 | -1.471 | -1.297 | 1.835 | 1.929 |
| -5.170000000000103 | -1.61 | -1.469 | -1.295 | 1.834 | 1.928 |
| -5.160000000000103 | -1.608 | -1.467 | -1.293 | 1.833 | 1.927 |
| -5.150000000000103 | -1.607 | -1.466 | -1.291 | 1.832 | 1.926 |
| -5.140000000000104 | -1.606 | -1.464 | -1.289 | 1.831 | 1.926 |
| -5.130000000000104 | -1.604 | -1.463 | -1.287 | 1.83 | 1.925 |
| -5.120000000000104 | -1.603 | -1.461 | -1.285 | 1.829 | 1.924 |
| -5.110000000000104 | -1.602 | -1.46 | -1.283 | 1.828 | 1.923 |
| -5.100000000000104 | -1.601 | -1.458 | -1.281 | 1.827 | 1.922 |
| -5.090000000000104 | -1.599 | -1.457 | -1.279 | 1.826 | 1.921 |
| -5.080000000000104 | -1.598 | -1.455 | -1.277 | 1.825 | 1.92 |
| -5.070000000000105 | -1.597 | -1.453 | -1.274 | 1.824 | 1.919 |
| -5.060000000000105 | -1.595 | -1.452 | -1.272 | 1.823 | 1.918 |
| -5.050000000000105 | -1.594 | -1.45 | -1.27 | 1.822 | 1.917 |
| -5.040000000000105 | -1.593 | -1.449 | -1.268 | 1.821 | 1.917 |
| -5.030000000000105 | -1.591 | -1.447 | -1.266 | 1.82 | 1.916 |
| -5.020000000000106 | -1.59 | -1.445 | -1.264 | 1.819 | 1.915 |
| -5.010000000000106 | -1.589 | -1.444 | -1.262 | 1.818 | 1.914 |
| -5.000000000000106 | -1.587 | -1.442 | -1.26 | 1.817 | 1.913 |
| -4.990000000000106 | -1.586 | -1.441 | -1.258 | 1.816 | 1.912 |
| -4.980000000000106 | -1.585 | -1.439 | -1.256 | 1.815 | 1.911 |
| -4.970000000000107 | -1.583 | -1.437 | -1.254 | 1.814 | 1.91 |
| -4.960000000000107 | -1.582 | -1.436 | -1.251 | 1.813 | 1.909 |
| -4.950000000000107 | -1.581 | -1.434 | -1.249 | 1.812 | 1.908 |
| -4.940000000000107 | -1.579 | -1.433 | -1.247 | 1.811 | 1.907 |
| -4.930000000000108 | -1.578 | -1.431 | -1.245 | 1.81 | 1.907 |
| -4.920000000000108 | -1.577 | -1.429 | -1.243 | 1.809 | 1.906 |
| -4.910000000000108 | -1.575 | -1.428 | -1.241 | 1.808 | 1.905 |
| -4.900000000000108 | -1.574 | -1.426 | -1.239 | 1.807 | 1.904 |
| -4.890000000000109 | -1.573 | -1.424 | -1.236 | 1.806 | 1.903 |
| -4.88000000000011 | -1.571 | -1.423 | -1.234 | 1.805 | 1.902 |
| -4.87000000000011 | -1.57 | -1.421 | -1.232 | 1.804 | 1.901 |
| -4.86000000000011 | -1.569 | -1.419 | -1.23 | 1.803 | 1.9 |
| -4.85000000000011 | -1.567 | -1.418 | -1.228 | 1.802 | 1.899 |
| -4.84000000000011 | -1.566 | -1.416 | -1.225 | 1.801 | 1.898 |
| -4.83000000000011 | -1.565 | -1.414 | -1.223 | 1.8 | 1.897 |
| -4.82000000000011 | -1.563 | -1.413 | -1.221 | 1.799 | 1.896 |
| -4.810000000000111 | -1.562 | -1.411 | -1.219 | 1.798 | 1.895 |
| -4.800000000000111 | -1.56 | -1.409 | -1.216 | 1.797 | 1.895 |
| -4.790000000000111 | -1.559 | -1.408 | -1.214 | 1.796 | 1.894 |
| -4.780000000000111 | -1.558 | -1.406 | -1.212 | 1.795 | 1.893 |
| -4.770000000000111 | -1.556 | -1.404 | -1.21 | 1.794 | 1.892 |
| -4.760000000000112 | -1.555 | -1.403 | -1.207 | 1.793 | 1.891 |
| -4.750000000000112 | -1.554 | -1.401 | -1.205 | 1.792 | 1.89 |
| -4.740000000000112 | -1.552 | -1.399 | -1.203 | 1.79 | 1.889 |
| -4.730000000000112 | -1.551 | -1.398 | -1.2 | 1.789 | 1.888 |
| -4.720000000000112 | -1.549 | -1.396 | -1.198 | 1.788 | 1.887 |
| -4.710000000000113 | -1.548 | -1.394 | -1.196 | 1.787 | 1.886 |
| -4.700000000000113 | -1.547 | -1.392 | -1.193 | 1.786 | 1.885 |
| -4.690000000000113 | -1.545 | -1.391 | -1.191 | 1.785 | 1.884 |
| -4.680000000000113 | -1.544 | -1.389 | -1.189 | 1.784 | 1.883 |
| -4.670000000000114 | -1.542 | -1.387 | -1.186 | 1.783 | 1.882 |
| -4.660000000000114 | -1.541 | -1.386 | -1.184 | 1.782 | 1.881 |
| -4.650000000000114 | -1.54 | -1.384 | -1.182 | 1.781 | 1.881 |
| -4.640000000000114 | -1.538 | -1.382 | -1.179 | 1.78 | 1.88 |
| -4.630000000000114 | -1.537 | -1.38 | -1.177 | 1.779 | 1.879 |
| -4.620000000000115 | -1.535 | -1.379 | -1.174 | 1.778 | 1.878 |
| -4.610000000000115 | -1.534 | -1.377 | -1.172 | 1.777 | 1.877 |
| -4.600000000000115 | -1.533 | -1.375 | -1.17 | 1.776 | 1.876 |
| -4.590000000000115 | -1.531 | -1.373 | -1.167 | 1.775 | 1.875 |
| -4.580000000000115 | -1.53 | -1.372 | -1.165 | 1.774 | 1.874 |
| -4.570000000000115 | -1.528 | -1.37 | -1.162 | 1.773 | 1.873 |
| -4.560000000000116 | -1.527 | -1.368 | -1.16 | 1.772 | 1.872 |
| -4.550000000000116 | -1.525 | -1.366 | -1.157 | 1.771 | 1.871 |
| -4.540000000000116 | -1.524 | -1.364 | -1.155 | 1.769 | 1.87 |
| -4.530000000000116 | -1.523 | -1.363 | -1.152 | 1.768 | 1.869 |
| -4.520000000000117 | -1.521 | -1.361 | -1.15 | 1.767 | 1.868 |
| -4.510000000000117 | -1.52 | -1.359 | -1.147 | 1.766 | 1.867 |
| -4.500000000000117 | -1.518 | -1.357 | -1.145 | 1.765 | 1.866 |
| -4.490000000000117 | -1.517 | -1.355 | -1.142 | 1.764 | 1.865 |
| -4.480000000000117 | -1.515 | -1.354 | -1.14 | 1.763 | 1.864 |
| -4.470000000000117 | -1.514 | -1.352 | -1.137 | 1.762 | 1.863 |
| -4.460000000000118 | -1.512 | -1.35 | -1.134 | 1.761 | 1.862 |
| -4.450000000000118 | -1.511 | -1.348 | -1.132 | 1.76 | 1.861 |
| -4.440000000000118 | -1.51 | -1.346 | -1.129 | 1.759 | 1.86 |
| -4.430000000000118 | -1.508 | -1.344 | -1.127 | 1.758 | 1.86 |
| -4.420000000000119 | -1.507 | -1.343 | -1.124 | 1.757 | 1.859 |
| -4.41000000000012 | -1.505 | -1.341 | -1.121 | 1.755 | 1.858 |
| -4.40000000000012 | -1.504 | -1.339 | -1.119 | 1.754 | 1.857 |
| -4.39000000000012 | -1.502 | -1.337 | -1.116 | 1.753 | 1.856 |
| -4.38000000000012 | -1.501 | -1.335 | -1.113 | 1.752 | 1.855 |
| -4.37000000000012 | -1.499 | -1.333 | -1.111 | 1.751 | 1.854 |
| -4.36000000000012 | -1.498 | -1.331 | -1.108 | 1.75 | 1.853 |
| -4.35000000000012 | -1.496 | -1.33 | -1.105 | 1.749 | 1.852 |
| -4.34000000000012 | -1.495 | -1.328 | -1.102 | 1.748 | 1.851 |
| -4.33000000000012 | -1.493 | -1.326 | -1.1 | 1.747 | 1.85 |
| -4.320000000000121 | -1.492 | -1.324 | -1.097 | 1.746 | 1.849 |
| -4.310000000000121 | -1.49 | -1.322 | -1.094 | 1.745 | 1.848 |
| -4.300000000000121 | -1.489 | -1.32 | -1.091 | 1.744 | 1.847 |
| -4.290000000000121 | -1.487 | -1.318 | -1.089 | 1.742 | 1.846 |
| -4.280000000000121 | -1.486 | -1.316 | -1.086 | 1.741 | 1.845 |
| -4.270000000000122 | -1.484 | -1.314 | -1.083 | 1.74 | 1.844 |
| -4.260000000000122 | -1.483 | -1.312 | -1.08 | 1.739 | 1.843 |
| -4.250000000000122 | -1.481 | -1.31 | -1.077 | 1.738 | 1.842 |
| -4.240000000000122 | -1.48 | -1.308 | -1.074 | 1.737 | 1.841 |
| -4.230000000000122 | -1.478 | -1.306 | -1.071 | 1.736 | 1.84 |
| -4.220000000000123 | -1.477 | -1.305 | -1.069 | 1.735 | 1.839 |
| -4.210000000000123 | -1.475 | -1.303 | -1.066 | 1.734 | 1.838 |
| -4.200000000000123 | -1.474 | -1.301 | -1.063 | 1.732 | 1.837 |
| -4.190000000000124 | -1.472 | -1.299 | -1.06 | 1.731 | 1.836 |
| -4.180000000000124 | -1.471 | -1.297 | -1.057 | 1.73 | 1.835 |
| -4.170000000000124 | -1.469 | -1.295 | -1.054 | 1.729 | 1.834 |
| -4.160000000000124 | -1.467 | -1.293 | -1.051 | 1.728 | 1.833 |
| -4.150000000000124 | -1.466 | -1.291 | -1.048 | 1.727 | 1.832 |
| -4.140000000000124 | -1.464 | -1.289 | -1.045 | 1.726 | 1.831 |
| -4.130000000000125 | -1.463 | -1.287 | -1.042 | 1.725 | 1.83 |
| -4.120000000000125 | -1.461 | -1.285 | -1.038 | 1.724 | 1.829 |
| -4.110000000000125 | -1.46 | -1.283 | -1.035 | 1.722 | 1.828 |
| -4.100000000000125 | -1.458 | -1.281 | -1.032 | 1.721 | 1.827 |
| -4.090000000000125 | -1.457 | -1.279 | -1.029 | 1.72 | 1.826 |
| -4.080000000000126 | -1.455 | -1.277 | -1.026 | 1.719 | 1.825 |
| -4.070000000000126 | -1.453 | -1.274 | -1.023 | 1.718 | 1.824 |
| -4.060000000000126 | -1.452 | -1.272 | -1.02 | 1.717 | 1.823 |
| -4.050000000000126 | -1.45 | -1.27 | -1.016 | 1.716 | 1.822 |
| -4.040000000000127 | -1.449 | -1.268 | -1.013 | 1.715 | 1.821 |
| -4.030000000000127 | -1.447 | -1.266 | -1.01 | 1.713 | 1.82 |
| -4.020000000000127 | -1.445 | -1.264 | -1.007 | 1.712 | 1.819 |
| -4.010000000000127 | -1.444 | -1.262 | -1.003 | 1.711 | 1.818 |
| -4.000000000000127 | -1.442 | -1.26 | -1 | 1.71 | 1.817 |
| -3.990000000000128 | -1.441 | -1.258 | -0.997 | 1.709 | 1.816 |
| -3.980000000000128 | -1.439 | -1.256 | -0.993 | 1.708 | 1.815 |
| -3.970000000000129 | -1.437 | -1.254 | -0.99 | 1.707 | 1.814 |
| -3.960000000000129 | -1.436 | -1.251 | -0.986 | 1.705 | 1.813 |
| -3.950000000000129 | -1.434 | -1.249 | -0.983 | 1.704 | 1.812 |
| -3.940000000000129 | -1.433 | -1.247 | -0.98 | 1.703 | 1.811 |
| -3.930000000000129 | -1.431 | -1.245 | -0.976 | 1.702 | 1.81 |
| -3.92000000000013 | -1.429 | -1.243 | -0.973 | 1.701 | 1.809 |
| -3.91000000000013 | -1.428 | -1.241 | -0.969 | 1.7 | 1.808 |
| -3.90000000000013 | -1.426 | -1.239 | -0.965 | 1.698 | 1.807 |
| -3.89000000000013 | -1.424 | -1.236 | -0.962 | 1.697 | 1.806 |
| -3.88000000000013 | -1.423 | -1.234 | -0.958 | 1.696 | 1.805 |
| -3.870000000000131 | -1.421 | -1.232 | -0.955 | 1.695 | 1.804 |
| -3.860000000000131 | -1.419 | -1.23 | -0.951 | 1.694 | 1.803 |
| -3.850000000000131 | -1.418 | -1.228 | -0.947 | 1.693 | 1.802 |
| -3.840000000000131 | -1.416 | -1.225 | -0.944 | 1.692 | 1.801 |
| -3.830000000000131 | -1.414 | -1.223 | -0.94 | 1.69 | 1.8 |
| -3.820000000000132 | -1.413 | -1.221 | -0.936 | 1.689 | 1.799 |
| -3.810000000000132 | -1.411 | -1.219 | -0.932 | 1.688 | 1.798 |
| -3.800000000000132 | -1.409 | -1.216 | -0.928 | 1.687 | 1.797 |
| -3.790000000000132 | -1.408 | -1.214 | -0.924 | 1.686 | 1.796 |
| -3.780000000000132 | -1.406 | -1.212 | -0.921 | 1.685 | 1.795 |
| -3.770000000000133 | -1.404 | -1.21 | -0.917 | 1.683 | 1.794 |
| -3.760000000000133 | -1.403 | -1.207 | -0.913 | 1.682 | 1.793 |
| -3.750000000000133 | -1.401 | -1.205 | -0.909 | 1.681 | 1.792 |
| -3.740000000000133 | -1.399 | -1.203 | -0.905 | 1.68 | 1.79 |
| -3.730000000000134 | -1.398 | -1.2 | -0.9 | 1.679 | 1.789 |
| -3.720000000000134 | -1.396 | -1.198 | -0.896 | 1.677 | 1.788 |
| -3.710000000000134 | -1.394 | -1.196 | -0.892 | 1.676 | 1.787 |
| -3.700000000000134 | -1.392 | -1.193 | -0.888 | 1.675 | 1.786 |
| -3.690000000000134 | -1.391 | -1.191 | -0.884 | 1.674 | 1.785 |
| -3.680000000000135 | -1.389 | -1.189 | -0.879 | 1.673 | 1.784 |
| -3.670000000000135 | -1.387 | -1.186 | -0.875 | 1.671 | 1.783 |
| -3.660000000000135 | -1.386 | -1.184 | -0.871 | 1.67 | 1.782 |
| -3.650000000000135 | -1.384 | -1.182 | -0.866 | 1.669 | 1.781 |
| -3.640000000000135 | -1.382 | -1.179 | -0.862 | 1.668 | 1.78 |
| -3.630000000000136 | -1.38 | -1.177 | -0.857 | 1.667 | 1.779 |
| -3.620000000000136 | -1.379 | -1.174 | -0.853 | 1.666 | 1.778 |
| -3.610000000000136 | -1.377 | -1.172 | -0.848 | 1.664 | 1.777 |
| -3.600000000000136 | -1.375 | -1.17 | -0.843 | 1.663 | 1.776 |
| -3.590000000000137 | -1.373 | -1.167 | -0.839 | 1.662 | 1.775 |
| -3.580000000000137 | -1.372 | -1.165 | -0.834 | 1.661 | 1.774 |
| -3.570000000000137 | -1.37 | -1.162 | -0.829 | 1.659 | 1.773 |
| -3.560000000000137 | -1.368 | -1.16 | -0.824 | 1.658 | 1.772 |
| -3.550000000000137 | -1.366 | -1.157 | -0.819 | 1.657 | 1.771 |
| -3.540000000000138 | -1.364 | -1.155 | -0.814 | 1.656 | 1.769 |
| -3.530000000000138 | -1.363 | -1.152 | -0.809 | 1.655 | 1.768 |
| -3.520000000000138 | -1.361 | -1.15 | -0.804 | 1.653 | 1.767 |
| -3.510000000000138 | -1.359 | -1.147 | -0.799 | 1.652 | 1.766 |
| -3.500000000000139 | -1.357 | -1.145 | -0.794 | 1.651 | 1.765 |
| -3.490000000000139 | -1.355 | -1.142 | -0.788 | 1.65 | 1.764 |
| -3.480000000000139 | -1.354 | -1.14 | -0.783 | 1.649 | 1.763 |
| -3.470000000000139 | -1.352 | -1.137 | -0.777 | 1.647 | 1.762 |
| -3.460000000000139 | -1.35 | -1.134 | -0.772 | 1.646 | 1.761 |
| -3.45000000000014 | -1.348 | -1.132 | -0.766 | 1.645 | 1.76 |
| -3.44000000000014 | -1.346 | -1.129 | -0.761 | 1.644 | 1.759 |
| -3.43000000000014 | -1.344 | -1.127 | -0.755 | 1.642 | 1.758 |
| -3.42000000000014 | -1.343 | -1.124 | -0.749 | 1.641 | 1.757 |
| -3.41000000000014 | -1.341 | -1.121 | -0.743 | 1.64 | 1.755 |
| -3.400000000000141 | -1.339 | -1.119 | -0.737 | 1.639 | 1.754 |
| -3.390000000000141 | -1.337 | -1.116 | -0.731 | 1.637 | 1.753 |
| -3.380000000000141 | -1.335 | -1.113 | -0.724 | 1.636 | 1.752 |
| -3.370000000000141 | -1.333 | -1.111 | -0.718 | 1.635 | 1.751 |
| -3.360000000000141 | -1.331 | -1.108 | -0.711 | 1.634 | 1.75 |
| -3.350000000000142 | -1.33 | -1.105 | -0.705 | 1.632 | 1.749 |
| -3.340000000000142 | -1.328 | -1.102 | -0.698 | 1.631 | 1.748 |
| -3.330000000000142 | -1.326 | -1.1 | -0.691 | 1.63 | 1.747 |
| -3.320000000000142 | -1.324 | -1.097 | -0.684 | 1.629 | 1.746 |
| -3.310000000000143 | -1.322 | -1.094 | -0.677 | 1.627 | 1.745 |
| -3.300000000000143 | -1.32 | -1.091 | -0.669 | 1.626 | 1.744 |
| -3.290000000000143 | -1.318 | -1.089 | -0.662 | 1.625 | 1.742 |
| -3.280000000000143 | -1.316 | -1.086 | -0.654 | 1.624 | 1.741 |
| -3.270000000000143 | -1.314 | -1.083 | -0.646 | 1.622 | 1.74 |
| -3.260000000000144 | -1.312 | -1.08 | -0.638 | 1.621 | 1.739 |
| -3.250000000000144 | -1.31 | -1.077 | -0.63 | 1.62 | 1.738 |
| -3.240000000000144 | -1.308 | -1.074 | -0.621 | 1.619 | 1.737 |
| -3.230000000000144 | -1.306 | -1.071 | -0.613 | 1.617 | 1.736 |
| -3.220000000000145 | -1.305 | -1.069 | -0.604 | 1.616 | 1.735 |
| -3.210000000000145 | -1.303 | -1.066 | -0.594 | 1.615 | 1.734 |
| -3.200000000000145 | -1.301 | -1.063 | -0.585 | 1.613 | 1.732 |
| -3.190000000000145 | -1.299 | -1.06 | -0.575 | 1.612 | 1.731 |
| -3.180000000000145 | -1.297 | -1.057 | -0.565 | 1.611 | 1.73 |
| -3.170000000000146 | -1.295 | -1.054 | -0.554 | 1.61 | 1.729 |
| -3.160000000000146 | -1.293 | -1.051 | -0.543 | 1.608 | 1.728 |
| -3.150000000000146 | -1.291 | -1.048 | -0.531 | 1.607 | 1.727 |
| -3.140000000000146 | -1.289 | -1.045 | -0.519 | 1.606 | 1.726 |
| -3.130000000000146 | -1.287 | -1.042 | -0.507 | 1.604 | 1.725 |
| -3.120000000000147 | -1.285 | -1.038 | -0.493 | 1.603 | 1.724 |
| -3.110000000000147 | -1.283 | -1.035 | -0.479 | 1.602 | 1.722 |
| -3.100000000000147 | -1.281 | -1.032 | -0.464 | 1.601 | 1.721 |
| -3.090000000000147 | -1.279 | -1.029 | -0.448 | 1.599 | 1.72 |
| -3.080000000000147 | -1.277 | -1.026 | -0.431 | 1.598 | 1.719 |
| -3.070000000000148 | -1.274 | -1.023 | -0.412 | 1.597 | 1.718 |
| -3.060000000000148 | -1.272 | -1.02 | -0.391 | 1.595 | 1.717 |
| -3.050000000000148 | -1.27 | -1.016 | -0.368 | 1.594 | 1.716 |
| -3.040000000000148 | -1.268 | -1.013 | -0.342 | 1.593 | 1.715 |
| -3.030000000000149 | -1.266 | -1.01 | -0.311 | 1.591 | 1.713 |
| -3.020000000000149 | -1.264 | -1.007 | -0.271 | 1.59 | 1.712 |
| -3.010000000000149 | -1.262 | -1.003 | -0.215 | 1.589 | 1.711 |
| -3.000000000000149 | -1.26 | -1 | 0 | 1.587 | 1.71 |
| -2.990000000000149 | -1.258 | -0.997 | 0.215 | 1.586 | 1.709 |
| -2.98000000000015 | -1.256 | -0.993 | 0.271 | 1.585 | 1.708 |
| -2.97000000000015 | -1.254 | -0.99 | 0.311 | 1.583 | 1.707 |
| -2.96000000000015 | -1.251 | -0.986 | 0.342 | 1.582 | 1.705 |
| -2.95000000000015 | -1.249 | -0.983 | 0.368 | 1.581 | 1.704 |
| -2.94000000000015 | -1.247 | -0.98 | 0.391 | 1.579 | 1.703 |
| -2.930000000000151 | -1.245 | -0.976 | 0.412 | 1.578 | 1.702 |
| -2.920000000000151 | -1.243 | -0.973 | 0.431 | 1.577 | 1.701 |
| -2.910000000000151 | -1.241 | -0.969 | 0.448 | 1.575 | 1.7 |
| -2.900000000000151 | -1.239 | -0.965 | 0.464 | 1.574 | 1.698 |
| -2.890000000000151 | -1.236 | -0.962 | 0.479 | 1.573 | 1.697 |
| -2.880000000000152 | -1.234 | -0.958 | 0.493 | 1.571 | 1.696 |
| -2.870000000000152 | -1.232 | -0.955 | 0.507 | 1.57 | 1.695 |
| -2.860000000000152 | -1.23 | -0.951 | 0.519 | 1.569 | 1.694 |
| -2.850000000000152 | -1.228 | -0.947 | 0.531 | 1.567 | 1.693 |
| -2.840000000000153 | -1.225 | -0.944 | 0.543 | 1.566 | 1.692 |
| -2.830000000000153 | -1.223 | -0.94 | 0.554 | 1.565 | 1.69 |
| -2.820000000000153 | -1.221 | -0.936 | 0.565 | 1.563 | 1.689 |
| -2.810000000000153 | -1.219 | -0.932 | 0.575 | 1.562 | 1.688 |
| -2.800000000000153 | -1.216 | -0.928 | 0.585 | 1.56 | 1.687 |
| -2.790000000000154 | -1.214 | -0.924 | 0.594 | 1.559 | 1.686 |
| -2.780000000000154 | -1.212 | -0.921 | 0.604 | 1.558 | 1.685 |
| -2.770000000000154 | -1.21 | -0.917 | 0.613 | 1.556 | 1.683 |
| -2.760000000000154 | -1.207 | -0.913 | 0.621 | 1.555 | 1.682 |
| -2.750000000000154 | -1.205 | -0.909 | 0.63 | 1.554 | 1.681 |
| -2.740000000000155 | -1.203 | -0.905 | 0.638 | 1.552 | 1.68 |
| -2.730000000000155 | -1.2 | -0.9 | 0.646 | 1.551 | 1.679 |
| -2.720000000000155 | -1.198 | -0.896 | 0.654 | 1.549 | 1.677 |
| -2.710000000000155 | -1.196 | -0.892 | 0.662 | 1.548 | 1.676 |
| -2.700000000000156 | -1.193 | -0.888 | 0.669 | 1.547 | 1.675 |
| -2.690000000000156 | -1.191 | -0.884 | 0.677 | 1.545 | 1.674 |
| -2.680000000000156 | -1.189 | -0.879 | 0.684 | 1.544 | 1.673 |
| -2.670000000000156 | -1.186 | -0.875 | 0.691 | 1.542 | 1.671 |
| -2.660000000000156 | -1.184 | -0.871 | 0.698 | 1.541 | 1.67 |
| -2.650000000000157 | -1.182 | -0.866 | 0.705 | 1.54 | 1.669 |
| -2.640000000000157 | -1.179 | -0.862 | 0.711 | 1.538 | 1.668 |
| -2.630000000000157 | -1.177 | -0.857 | 0.718 | 1.537 | 1.667 |
| -2.620000000000157 | -1.174 | -0.853 | 0.724 | 1.535 | 1.666 |
| -2.610000000000157 | -1.172 | -0.848 | 0.731 | 1.534 | 1.664 |
| -2.600000000000158 | -1.17 | -0.843 | 0.737 | 1.533 | 1.663 |
| -2.590000000000158 | -1.167 | -0.839 | 0.743 | 1.531 | 1.662 |
| -2.580000000000158 | -1.165 | -0.834 | 0.749 | 1.53 | 1.661 |
| -2.570000000000158 | -1.162 | -0.829 | 0.755 | 1.528 | 1.659 |
| -2.560000000000159 | -1.16 | -0.824 | 0.761 | 1.527 | 1.658 |
| -2.550000000000159 | -1.157 | -0.819 | 0.766 | 1.525 | 1.657 |
| -2.54000000000016 | -1.155 | -0.814 | 0.772 | 1.524 | 1.656 |
| -2.530000000000159 | -1.152 | -0.809 | 0.777 | 1.523 | 1.655 |
| -2.520000000000159 | -1.15 | -0.804 | 0.783 | 1.521 | 1.653 |
| -2.51000000000016 | -1.147 | -0.799 | 0.788 | 1.52 | 1.652 |
| -2.50000000000016 | -1.145 | -0.794 | 0.794 | 1.518 | 1.651 |
| -2.49000000000016 | -1.142 | -0.788 | 0.799 | 1.517 | 1.65 |
| -2.48000000000016 | -1.14 | -0.783 | 0.804 | 1.515 | 1.649 |
| -2.47000000000016 | -1.137 | -0.777 | 0.809 | 1.514 | 1.647 |
| -2.460000000000161 | -1.134 | -0.772 | 0.814 | 1.512 | 1.646 |
| -2.450000000000161 | -1.132 | -0.766 | 0.819 | 1.511 | 1.645 |
| -2.440000000000161 | -1.129 | -0.761 | 0.824 | 1.51 | 1.644 |
| -2.430000000000161 | -1.127 | -0.755 | 0.829 | 1.508 | 1.642 |
| -2.420000000000162 | -1.124 | -0.749 | 0.834 | 1.507 | 1.641 |
| -2.410000000000162 | -1.121 | -0.743 | 0.839 | 1.505 | 1.64 |
| -2.400000000000162 | -1.119 | -0.737 | 0.843 | 1.504 | 1.639 |
| -2.390000000000162 | -1.116 | -0.731 | 0.848 | 1.502 | 1.637 |
| -2.380000000000162 | -1.113 | -0.724 | 0.853 | 1.501 | 1.636 |
| -2.370000000000163 | -1.111 | -0.718 | 0.857 | 1.499 | 1.635 |
| -2.360000000000163 | -1.108 | -0.711 | 0.862 | 1.498 | 1.634 |
| -2.350000000000163 | -1.105 | -0.705 | 0.866 | 1.496 | 1.632 |
| -2.340000000000163 | -1.102 | -0.698 | 0.871 | 1.495 | 1.631 |
| -2.330000000000163 | -1.1 | -0.691 | 0.875 | 1.493 | 1.63 |
| -2.320000000000164 | -1.097 | -0.684 | 0.879 | 1.492 | 1.629 |
| -2.310000000000164 | -1.094 | -0.677 | 0.884 | 1.49 | 1.627 |
| -2.300000000000164 | -1.091 | -0.669 | 0.888 | 1.489 | 1.626 |
| -2.290000000000164 | -1.089 | -0.662 | 0.892 | 1.487 | 1.625 |
| -2.280000000000165 | -1.086 | -0.654 | 0.896 | 1.486 | 1.624 |
| -2.270000000000165 | -1.083 | -0.646 | 0.9 | 1.484 | 1.622 |
| -2.260000000000165 | -1.08 | -0.638 | 0.905 | 1.483 | 1.621 |
| -2.250000000000165 | -1.077 | -0.63 | 0.909 | 1.481 | 1.62 |
| -2.240000000000165 | -1.074 | -0.621 | 0.913 | 1.48 | 1.619 |
| -2.230000000000166 | -1.071 | -0.613 | 0.917 | 1.478 | 1.617 |
| -2.220000000000166 | -1.069 | -0.604 | 0.921 | 1.477 | 1.616 |
| -2.210000000000166 | -1.066 | -0.594 | 0.924 | 1.475 | 1.615 |
| -2.200000000000166 | -1.063 | -0.585 | 0.928 | 1.474 | 1.613 |
| -2.190000000000166 | -1.06 | -0.575 | 0.932 | 1.472 | 1.612 |
| -2.180000000000167 | -1.057 | -0.565 | 0.936 | 1.471 | 1.611 |
| -2.170000000000167 | -1.054 | -0.554 | 0.94 | 1.469 | 1.61 |
| -2.160000000000167 | -1.051 | -0.543 | 0.944 | 1.467 | 1.608 |
| -2.150000000000167 | -1.048 | -0.531 | 0.947 | 1.466 | 1.607 |
| -2.140000000000168 | -1.045 | -0.519 | 0.951 | 1.464 | 1.606 |
| -2.130000000000168 | -1.042 | -0.507 | 0.955 | 1.463 | 1.604 |
| -2.120000000000168 | -1.038 | -0.493 | 0.958 | 1.461 | 1.603 |
| -2.110000000000168 | -1.035 | -0.479 | 0.962 | 1.46 | 1.602 |
| -2.100000000000168 | -1.032 | -0.464 | 0.965 | 1.458 | 1.601 |
| -2.090000000000169 | -1.029 | -0.448 | 0.969 | 1.457 | 1.599 |
| -2.080000000000169 | -1.026 | -0.431 | 0.973 | 1.455 | 1.598 |
| -2.070000000000169 | -1.023 | -0.412 | 0.976 | 1.453 | 1.597 |
| -2.060000000000169 | -1.02 | -0.391 | 0.98 | 1.452 | 1.595 |
| -2.050000000000169 | -1.016 | -0.368 | 0.983 | 1.45 | 1.594 |
| -2.04000000000017 | -1.013 | -0.342 | 0.986 | 1.449 | 1.593 |
| -2.03000000000017 | -1.01 | -0.311 | 0.99 | 1.447 | 1.591 |
| -2.02000000000017 | -1.007 | -0.271 | 0.993 | 1.445 | 1.59 |
| -2.01000000000017 | -1.003 | -0.215 | 0.997 | 1.444 | 1.589 |
| -2.000000000000171 | -1 | 0 | 1 | 1.442 | 1.587 |
| -1.99000000000017 | -0.997 | 0.215 | 1.003 | 1.441 | 1.586 |
| -1.98000000000017 | -0.993 | 0.271 | 1.007 | 1.439 | 1.585 |
| -1.97000000000017 | -0.99 | 0.311 | 1.01 | 1.437 | 1.583 |
| -1.96000000000017 | -0.986 | 0.342 | 1.013 | 1.436 | 1.582 |
| -1.95000000000017 | -0.983 | 0.368 | 1.016 | 1.434 | 1.581 |
| -1.94000000000017 | -0.98 | 0.391 | 1.02 | 1.433 | 1.579 |
| -1.93000000000017 | -0.976 | 0.412 | 1.023 | 1.431 | 1.578 |
| -1.92000000000017 | -0.973 | 0.431 | 1.026 | 1.429 | 1.577 |
| -1.91000000000017 | -0.969 | 0.448 | 1.029 | 1.428 | 1.575 |
| -1.90000000000017 | -0.965 | 0.464 | 1.032 | 1.426 | 1.574 |
| -1.89000000000017 | -0.962 | 0.479 | 1.035 | 1.424 | 1.573 |
| -1.88000000000017 | -0.958 | 0.493 | 1.038 | 1.423 | 1.571 |
| -1.87000000000017 | -0.955 | 0.507 | 1.042 | 1.421 | 1.57 |
| -1.86000000000017 | -0.951 | 0.519 | 1.045 | 1.419 | 1.569 |
| -1.85000000000017 | -0.947 | 0.531 | 1.048 | 1.418 | 1.567 |
| -1.84000000000017 | -0.944 | 0.543 | 1.051 | 1.416 | 1.566 |
| -1.83000000000017 | -0.94 | 0.554 | 1.054 | 1.414 | 1.565 |
| -1.82000000000017 | -0.936 | 0.565 | 1.057 | 1.413 | 1.563 |
| -1.81000000000017 | -0.932 | 0.575 | 1.06 | 1.411 | 1.562 |
| -1.80000000000017 | -0.928 | 0.585 | 1.063 | 1.409 | 1.56 |
| -1.79000000000017 | -0.924 | 0.594 | 1.066 | 1.408 | 1.559 |
| -1.78000000000017 | -0.921 | 0.604 | 1.069 | 1.406 | 1.558 |
| -1.77000000000017 | -0.917 | 0.613 | 1.071 | 1.404 | 1.556 |
| -1.76000000000017 | -0.913 | 0.621 | 1.074 | 1.403 | 1.555 |
| -1.75000000000017 | -0.909 | 0.63 | 1.077 | 1.401 | 1.554 |
| -1.74000000000017 | -0.905 | 0.638 | 1.08 | 1.399 | 1.552 |
| -1.73000000000017 | -0.9 | 0.646 | 1.083 | 1.398 | 1.551 |
| -1.72000000000017 | -0.896 | 0.654 | 1.086 | 1.396 | 1.549 |
| -1.71000000000017 | -0.892 | 0.662 | 1.089 | 1.394 | 1.548 |
| -1.70000000000017 | -0.888 | 0.669 | 1.091 | 1.392 | 1.547 |
| -1.69000000000017 | -0.884 | 0.677 | 1.094 | 1.391 | 1.545 |
| -1.68000000000017 | -0.879 | 0.684 | 1.097 | 1.389 | 1.544 |
| -1.67000000000017 | -0.875 | 0.691 | 1.1 | 1.387 | 1.542 |
| -1.66000000000017 | -0.871 | 0.698 | 1.102 | 1.386 | 1.541 |
| -1.65000000000017 | -0.866 | 0.705 | 1.105 | 1.384 | 1.54 |
| -1.64000000000017 | -0.862 | 0.711 | 1.108 | 1.382 | 1.538 |
| -1.63000000000017 | -0.857 | 0.718 | 1.111 | 1.38 | 1.537 |
| -1.62000000000017 | -0.853 | 0.724 | 1.113 | 1.379 | 1.535 |
| -1.61000000000017 | -0.848 | 0.731 | 1.116 | 1.377 | 1.534 |
| -1.60000000000017 | -0.843 | 0.737 | 1.119 | 1.375 | 1.533 |
| -1.59000000000017 | -0.839 | 0.743 | 1.121 | 1.373 | 1.531 |
| -1.58000000000017 | -0.834 | 0.749 | 1.124 | 1.372 | 1.53 |
| -1.57000000000017 | -0.829 | 0.755 | 1.127 | 1.37 | 1.528 |
| -1.56000000000017 | -0.824 | 0.761 | 1.129 | 1.368 | 1.527 |
| -1.55000000000017 | -0.819 | 0.766 | 1.132 | 1.366 | 1.525 |
| -1.54000000000017 | -0.814 | 0.772 | 1.134 | 1.364 | 1.524 |
| -1.53000000000017 | -0.809 | 0.777 | 1.137 | 1.363 | 1.523 |
| -1.52000000000017 | -0.804 | 0.783 | 1.14 | 1.361 | 1.521 |
| -1.51000000000017 | -0.799 | 0.788 | 1.142 | 1.359 | 1.52 |
| -1.50000000000017 | -0.794 | 0.794 | 1.145 | 1.357 | 1.518 |
| -1.49000000000017 | -0.788 | 0.799 | 1.147 | 1.355 | 1.517 |
| -1.48000000000017 | -0.783 | 0.804 | 1.15 | 1.354 | 1.515 |
| -1.47000000000017 | -0.777 | 0.809 | 1.152 | 1.352 | 1.514 |
| -1.46000000000017 | -0.772 | 0.814 | 1.155 | 1.35 | 1.512 |
| -1.45000000000017 | -0.766 | 0.819 | 1.157 | 1.348 | 1.511 |
| -1.44000000000017 | -0.761 | 0.824 | 1.16 | 1.346 | 1.51 |
| -1.43000000000017 | -0.755 | 0.829 | 1.162 | 1.344 | 1.508 |
| -1.42000000000017 | -0.749 | 0.834 | 1.165 | 1.343 | 1.507 |
| -1.41000000000017 | -0.743 | 0.839 | 1.167 | 1.341 | 1.505 |
| -1.40000000000017 | -0.737 | 0.843 | 1.17 | 1.339 | 1.504 |
| -1.39000000000017 | -0.731 | 0.848 | 1.172 | 1.337 | 1.502 |
| -1.38000000000017 | -0.724 | 0.853 | 1.174 | 1.335 | 1.501 |
| -1.37000000000017 | -0.718 | 0.857 | 1.177 | 1.333 | 1.499 |
| -1.36000000000017 | -0.711 | 0.862 | 1.179 | 1.331 | 1.498 |
| -1.35000000000017 | -0.705 | 0.866 | 1.182 | 1.33 | 1.496 |
| -1.34000000000017 | -0.698 | 0.871 | 1.184 | 1.328 | 1.495 |
| -1.33000000000017 | -0.691 | 0.875 | 1.186 | 1.326 | 1.493 |
| -1.32000000000017 | -0.684 | 0.879 | 1.189 | 1.324 | 1.492 |
| -1.31000000000017 | -0.677 | 0.884 | 1.191 | 1.322 | 1.49 |
| -1.30000000000017 | -0.669 | 0.888 | 1.193 | 1.32 | 1.489 |
| -1.29000000000017 | -0.662 | 0.892 | 1.196 | 1.318 | 1.487 |
| -1.28000000000017 | -0.654 | 0.896 | 1.198 | 1.316 | 1.486 |
| -1.27000000000017 | -0.646 | 0.9 | 1.2 | 1.314 | 1.484 |
| -1.26000000000017 | -0.638 | 0.905 | 1.203 | 1.312 | 1.483 |
| -1.25000000000017 | -0.63 | 0.909 | 1.205 | 1.31 | 1.481 |
| -1.24000000000017 | -0.621 | 0.913 | 1.207 | 1.308 | 1.48 |
| -1.23000000000017 | -0.613 | 0.917 | 1.21 | 1.306 | 1.478 |
| -1.22000000000017 | -0.604 | 0.921 | 1.212 | 1.305 | 1.477 |
| -1.21000000000017 | -0.594 | 0.924 | 1.214 | 1.303 | 1.475 |
| -1.20000000000017 | -0.585 | 0.928 | 1.216 | 1.301 | 1.474 |
| -1.19000000000017 | -0.575 | 0.932 | 1.219 | 1.299 | 1.472 |
| -1.18000000000017 | -0.565 | 0.936 | 1.221 | 1.297 | 1.471 |
| -1.17000000000017 | -0.554 | 0.94 | 1.223 | 1.295 | 1.469 |
| -1.16000000000017 | -0.543 | 0.944 | 1.225 | 1.293 | 1.467 |
| -1.15000000000017 | -0.531 | 0.947 | 1.228 | 1.291 | 1.466 |
| -1.14000000000017 | -0.519 | 0.951 | 1.23 | 1.289 | 1.464 |
| -1.13000000000017 | -0.507 | 0.955 | 1.232 | 1.287 | 1.463 |
| -1.12000000000017 | -0.493 | 0.958 | 1.234 | 1.285 | 1.461 |
| -1.11000000000017 | -0.479 | 0.962 | 1.236 | 1.283 | 1.46 |
| -1.10000000000017 | -0.464 | 0.965 | 1.239 | 1.281 | 1.458 |
| -1.09000000000017 | -0.448 | 0.969 | 1.241 | 1.279 | 1.457 |
| -1.08000000000017 | -0.431 | 0.973 | 1.243 | 1.277 | 1.455 |
| -1.07000000000017 | -0.412 | 0.976 | 1.245 | 1.274 | 1.453 |
| -1.06000000000017 | -0.391 | 0.98 | 1.247 | 1.272 | 1.452 |
| -1.05000000000017 | -0.368 | 0.983 | 1.249 | 1.27 | 1.45 |
| -1.04000000000017 | -0.342 | 0.986 | 1.251 | 1.268 | 1.449 |
| -1.03000000000017 | -0.311 | 0.99 | 1.254 | 1.266 | 1.447 |
| -1.02000000000017 | -0.271 | 0.993 | 1.256 | 1.264 | 1.445 |
| -1.01000000000017 | -0.215 | 0.997 | 1.258 | 1.262 | 1.444 |
| -1.00000000000017 | 0 | 1 | 1.26 | 1.26 | 1.442 |
| -0.99000000000017 | 0.215 | 1.003 | 1.262 | 1.258 | 1.441 |
| -0.98000000000017 | 0.271 | 1.007 | 1.264 | 1.256 | 1.439 |
| -0.97000000000017 | 0.311 | 1.01 | 1.266 | 1.254 | 1.437 |
| -0.96000000000017 | 0.342 | 1.013 | 1.268 | 1.251 | 1.436 |
| -0.95000000000017 | 0.368 | 1.016 | 1.27 | 1.249 | 1.434 |
| -0.94000000000017 | 0.391 | 1.02 | 1.272 | 1.247 | 1.433 |
| -0.93000000000017 | 0.412 | 1.023 | 1.274 | 1.245 | 1.431 |
| -0.92000000000017 | 0.431 | 1.026 | 1.277 | 1.243 | 1.429 |
| -0.91000000000017 | 0.448 | 1.029 | 1.279 | 1.241 | 1.428 |
| -0.90000000000017 | 0.464 | 1.032 | 1.281 | 1.239 | 1.426 |
| -0.890000000000169 | 0.479 | 1.035 | 1.283 | 1.236 | 1.424 |
| -0.880000000000169 | 0.493 | 1.038 | 1.285 | 1.234 | 1.423 |
| -0.870000000000169 | 0.507 | 1.042 | 1.287 | 1.232 | 1.421 |
| -0.860000000000169 | 0.519 | 1.045 | 1.289 | 1.23 | 1.419 |
| -0.850000000000169 | 0.531 | 1.048 | 1.291 | 1.228 | 1.418 |
| -0.840000000000169 | 0.543 | 1.051 | 1.293 | 1.225 | 1.416 |
| -0.830000000000169 | 0.554 | 1.054 | 1.295 | 1.223 | 1.414 |
| -0.820000000000169 | 0.565 | 1.057 | 1.297 | 1.221 | 1.413 |
| -0.810000000000169 | 0.575 | 1.06 | 1.299 | 1.219 | 1.411 |
| -0.800000000000169 | 0.585 | 1.063 | 1.301 | 1.216 | 1.409 |
| -0.790000000000169 | 0.594 | 1.066 | 1.303 | 1.214 | 1.408 |
| -0.780000000000169 | 0.604 | 1.069 | 1.305 | 1.212 | 1.406 |
| -0.770000000000169 | 0.613 | 1.071 | 1.306 | 1.21 | 1.404 |
| -0.760000000000169 | 0.621 | 1.074 | 1.308 | 1.207 | 1.403 |
| -0.750000000000169 | 0.63 | 1.077 | 1.31 | 1.205 | 1.401 |
| -0.740000000000169 | 0.638 | 1.08 | 1.312 | 1.203 | 1.399 |
| -0.730000000000169 | 0.646 | 1.083 | 1.314 | 1.2 | 1.398 |
| -0.720000000000169 | 0.654 | 1.086 | 1.316 | 1.198 | 1.396 |
| -0.710000000000169 | 0.662 | 1.089 | 1.318 | 1.196 | 1.394 |
| -0.700000000000169 | 0.669 | 1.091 | 1.32 | 1.193 | 1.392 |
| -0.690000000000169 | 0.677 | 1.094 | 1.322 | 1.191 | 1.391 |
| -0.680000000000169 | 0.684 | 1.097 | 1.324 | 1.189 | 1.389 |
| -0.670000000000169 | 0.691 | 1.1 | 1.326 | 1.186 | 1.387 |
| -0.660000000000169 | 0.698 | 1.102 | 1.328 | 1.184 | 1.386 |
| -0.650000000000169 | 0.705 | 1.105 | 1.33 | 1.182 | 1.384 |
| -0.640000000000169 | 0.711 | 1.108 | 1.331 | 1.179 | 1.382 |
| -0.630000000000169 | 0.718 | 1.111 | 1.333 | 1.177 | 1.38 |
| -0.620000000000169 | 0.724 | 1.113 | 1.335 | 1.174 | 1.379 |
| -0.610000000000169 | 0.731 | 1.116 | 1.337 | 1.172 | 1.377 |
| -0.600000000000169 | 0.737 | 1.119 | 1.339 | 1.17 | 1.375 |
| -0.590000000000169 | 0.743 | 1.121 | 1.341 | 1.167 | 1.373 |
| -0.580000000000169 | 0.749 | 1.124 | 1.343 | 1.165 | 1.372 |
| -0.570000000000169 | 0.755 | 1.127 | 1.344 | 1.162 | 1.37 |
| -0.560000000000169 | 0.761 | 1.129 | 1.346 | 1.16 | 1.368 |
| -0.550000000000169 | 0.766 | 1.132 | 1.348 | 1.157 | 1.366 |
| -0.540000000000169 | 0.772 | 1.134 | 1.35 | 1.155 | 1.364 |
| -0.530000000000169 | 0.777 | 1.137 | 1.352 | 1.152 | 1.363 |
| -0.520000000000169 | 0.783 | 1.14 | 1.354 | 1.15 | 1.361 |
| -0.510000000000169 | 0.788 | 1.142 | 1.355 | 1.147 | 1.359 |
| -0.500000000000169 | 0.794 | 1.145 | 1.357 | 1.145 | 1.357 |
| -0.490000000000169 | 0.799 | 1.147 | 1.359 | 1.142 | 1.355 |
| -0.480000000000169 | 0.804 | 1.15 | 1.361 | 1.14 | 1.354 |
| -0.470000000000169 | 0.809 | 1.152 | 1.363 | 1.137 | 1.352 |
| -0.460000000000169 | 0.814 | 1.155 | 1.364 | 1.134 | 1.35 |
| -0.450000000000169 | 0.819 | 1.157 | 1.366 | 1.132 | 1.348 |
| -0.440000000000169 | 0.824 | 1.16 | 1.368 | 1.129 | 1.346 |
| -0.430000000000169 | 0.829 | 1.162 | 1.37 | 1.127 | 1.344 |
| -0.420000000000169 | 0.834 | 1.165 | 1.372 | 1.124 | 1.343 |
| -0.410000000000169 | 0.839 | 1.167 | 1.373 | 1.121 | 1.341 |
| -0.400000000000169 | 0.843 | 1.17 | 1.375 | 1.119 | 1.339 |
| -0.390000000000169 | 0.848 | 1.172 | 1.377 | 1.116 | 1.337 |
| -0.380000000000169 | 0.853 | 1.174 | 1.379 | 1.113 | 1.335 |
| -0.370000000000169 | 0.857 | 1.177 | 1.38 | 1.111 | 1.333 |
| -0.360000000000169 | 0.862 | 1.179 | 1.382 | 1.108 | 1.331 |
| -0.350000000000169 | 0.866 | 1.182 | 1.384 | 1.105 | 1.33 |
| -0.340000000000169 | 0.871 | 1.184 | 1.386 | 1.102 | 1.328 |
| -0.330000000000169 | 0.875 | 1.186 | 1.387 | 1.1 | 1.326 |
| -0.320000000000169 | 0.879 | 1.189 | 1.389 | 1.097 | 1.324 |
| -0.310000000000169 | 0.884 | 1.191 | 1.391 | 1.094 | 1.322 |
| -0.300000000000169 | 0.888 | 1.193 | 1.392 | 1.091 | 1.32 |
| -0.290000000000169 | 0.892 | 1.196 | 1.394 | 1.089 | 1.318 |
| -0.280000000000169 | 0.896 | 1.198 | 1.396 | 1.086 | 1.316 |
| -0.270000000000169 | 0.9 | 1.2 | 1.398 | 1.083 | 1.314 |
| -0.260000000000169 | 0.905 | 1.203 | 1.399 | 1.08 | 1.312 |
| -0.250000000000169 | 0.909 | 1.205 | 1.401 | 1.077 | 1.31 |
| -0.240000000000169 | 0.913 | 1.207 | 1.403 | 1.074 | 1.308 |
| -0.230000000000169 | 0.917 | 1.21 | 1.404 | 1.071 | 1.306 |
| -0.220000000000169 | 0.921 | 1.212 | 1.406 | 1.069 | 1.305 |
| -0.210000000000169 | 0.924 | 1.214 | 1.408 | 1.066 | 1.303 |
| -0.200000000000169 | 0.928 | 1.216 | 1.409 | 1.063 | 1.301 |
| -0.190000000000169 | 0.932 | 1.219 | 1.411 | 1.06 | 1.299 |
| -0.180000000000169 | 0.936 | 1.221 | 1.413 | 1.057 | 1.297 |
| -0.170000000000169 | 0.94 | 1.223 | 1.414 | 1.054 | 1.295 |
| -0.160000000000169 | 0.944 | 1.225 | 1.416 | 1.051 | 1.293 |
| -0.150000000000169 | 0.947 | 1.228 | 1.418 | 1.048 | 1.291 |
| -0.140000000000169 | 0.951 | 1.23 | 1.419 | 1.045 | 1.289 |
| -0.130000000000169 | 0.955 | 1.232 | 1.421 | 1.042 | 1.287 |
| -0.120000000000169 | 0.958 | 1.234 | 1.423 | 1.038 | 1.285 |
| -0.110000000000169 | 0.962 | 1.236 | 1.424 | 1.035 | 1.283 |
| -0.100000000000169 | 0.965 | 1.239 | 1.426 | 1.032 | 1.281 |
| -0.0900000000001689 | 0.969 | 1.241 | 1.428 | 1.029 | 1.279 |
| -0.0800000000001689 | 0.973 | 1.243 | 1.429 | 1.026 | 1.277 |
| -0.0700000000001689 | 0.976 | 1.245 | 1.431 | 1.023 | 1.274 |
| -0.0600000000001689 | 0.98 | 1.247 | 1.433 | 1.02 | 1.272 |
| -0.0500000000001689 | 0.983 | 1.249 | 1.434 | 1.016 | 1.27 |
| -0.0400000000001689 | 0.986 | 1.251 | 1.436 | 1.013 | 1.268 |
| -0.0300000000001689 | 0.99 | 1.254 | 1.437 | 1.01 | 1.266 |
| -0.0200000000001689 | 0.993 | 1.256 | 1.439 | 1.007 | 1.264 |
| -0.0100000000001689 | 0.997 | 1.258 | 1.441 | 1.003 | 1.262 |
| -1.6888920817415e-13 | 1 | 1.26 | 1.442 | 1 | 1.26 |
| 0.00999999999983111 | 1.003 | 1.262 | 1.444 | 0.997 | 1.258 |
| 0.0199999999998311 | 1.007 | 1.264 | 1.445 | 0.993 | 1.256 |
| 0.0299999999998311 | 1.01 | 1.266 | 1.447 | 0.99 | 1.254 |
| 0.0399999999998311 | 1.013 | 1.268 | 1.449 | 0.986 | 1.251 |
| 0.0499999999998311 | 1.016 | 1.27 | 1.45 | 0.983 | 1.249 |
| 0.0599999999998311 | 1.02 | 1.272 | 1.452 | 0.98 | 1.247 |
| 0.0699999999998311 | 1.023 | 1.274 | 1.453 | 0.976 | 1.245 |
| 0.0799999999998311 | 1.026 | 1.277 | 1.455 | 0.973 | 1.243 |
| 0.0899999999998311 | 1.029 | 1.279 | 1.457 | 0.969 | 1.241 |
| 0.0999999999998311 | 1.032 | 1.281 | 1.458 | 0.965 | 1.239 |
| 0.109999999999831 | 1.035 | 1.283 | 1.46 | 0.962 | 1.236 |
| 0.119999999999831 | 1.038 | 1.285 | 1.461 | 0.958 | 1.234 |
| 0.129999999999831 | 1.042 | 1.287 | 1.463 | 0.955 | 1.232 |
| 0.139999999999831 | 1.045 | 1.289 | 1.464 | 0.951 | 1.23 |
| 0.149999999999831 | 1.048 | 1.291 | 1.466 | 0.947 | 1.228 |
| 0.159999999999831 | 1.051 | 1.293 | 1.467 | 0.944 | 1.225 |
| 0.169999999999831 | 1.054 | 1.295 | 1.469 | 0.94 | 1.223 |
| 0.179999999999831 | 1.057 | 1.297 | 1.471 | 0.936 | 1.221 |
| 0.189999999999831 | 1.06 | 1.299 | 1.472 | 0.932 | 1.219 |
| 0.199999999999831 | 1.063 | 1.301 | 1.474 | 0.928 | 1.216 |
| 0.209999999999831 | 1.066 | 1.303 | 1.475 | 0.924 | 1.214 |
| 0.219999999999831 | 1.069 | 1.305 | 1.477 | 0.921 | 1.212 |
| 0.229999999999831 | 1.071 | 1.306 | 1.478 | 0.917 | 1.21 |
| 0.239999999999831 | 1.074 | 1.308 | 1.48 | 0.913 | 1.207 |
| 0.249999999999831 | 1.077 | 1.31 | 1.481 | 0.909 | 1.205 |
| 0.259999999999831 | 1.08 | 1.312 | 1.483 | 0.905 | 1.203 |
| 0.269999999999831 | 1.083 | 1.314 | 1.484 | 0.9 | 1.2 |
| 0.279999999999831 | 1.086 | 1.316 | 1.486 | 0.896 | 1.198 |
| 0.289999999999831 | 1.089 | 1.318 | 1.487 | 0.892 | 1.196 |
| 0.299999999999831 | 1.091 | 1.32 | 1.489 | 0.888 | 1.193 |
| 0.309999999999831 | 1.094 | 1.322 | 1.49 | 0.884 | 1.191 |
| 0.319999999999831 | 1.097 | 1.324 | 1.492 | 0.879 | 1.189 |
| 0.329999999999831 | 1.1 | 1.326 | 1.493 | 0.875 | 1.186 |
| 0.339999999999831 | 1.102 | 1.328 | 1.495 | 0.871 | 1.184 |
| 0.349999999999831 | 1.105 | 1.33 | 1.496 | 0.866 | 1.182 |
| 0.359999999999831 | 1.108 | 1.331 | 1.498 | 0.862 | 1.179 |
| 0.369999999999831 | 1.111 | 1.333 | 1.499 | 0.857 | 1.177 |
| 0.379999999999831 | 1.113 | 1.335 | 1.501 | 0.853 | 1.174 |
| 0.389999999999831 | 1.116 | 1.337 | 1.502 | 0.848 | 1.172 |
| 0.399999999999831 | 1.119 | 1.339 | 1.504 | 0.843 | 1.17 |
| 0.409999999999831 | 1.121 | 1.341 | 1.505 | 0.839 | 1.167 |
| 0.419999999999831 | 1.124 | 1.343 | 1.507 | 0.834 | 1.165 |
| 0.429999999999831 | 1.127 | 1.344 | 1.508 | 0.829 | 1.162 |
| 0.439999999999831 | 1.129 | 1.346 | 1.51 | 0.824 | 1.16 |
| 0.449999999999831 | 1.132 | 1.348 | 1.511 | 0.819 | 1.157 |
| 0.459999999999831 | 1.134 | 1.35 | 1.512 | 0.814 | 1.155 |
| 0.469999999999831 | 1.137 | 1.352 | 1.514 | 0.809 | 1.152 |
| 0.479999999999831 | 1.14 | 1.354 | 1.515 | 0.804 | 1.15 |
| 0.489999999999831 | 1.142 | 1.355 | 1.517 | 0.799 | 1.147 |
| 0.499999999999831 | 1.145 | 1.357 | 1.518 | 0.794 | 1.145 |
| 0.509999999999831 | 1.147 | 1.359 | 1.52 | 0.788 | 1.142 |
| 0.519999999999831 | 1.15 | 1.361 | 1.521 | 0.783 | 1.14 |
| 0.529999999999831 | 1.152 | 1.363 | 1.523 | 0.777 | 1.137 |
| 0.539999999999831 | 1.155 | 1.364 | 1.524 | 0.772 | 1.134 |
| 0.549999999999831 | 1.157 | 1.366 | 1.525 | 0.766 | 1.132 |
| 0.559999999999831 | 1.16 | 1.368 | 1.527 | 0.761 | 1.129 |
| 0.569999999999831 | 1.162 | 1.37 | 1.528 | 0.755 | 1.127 |
| 0.579999999999831 | 1.165 | 1.372 | 1.53 | 0.749 | 1.124 |
| 0.589999999999831 | 1.167 | 1.373 | 1.531 | 0.743 | 1.121 |
| 0.599999999999831 | 1.17 | 1.375 | 1.533 | 0.737 | 1.119 |
| 0.609999999999831 | 1.172 | 1.377 | 1.534 | 0.731 | 1.116 |
| 0.619999999999831 | 1.174 | 1.379 | 1.535 | 0.724 | 1.113 |
| 0.629999999999831 | 1.177 | 1.38 | 1.537 | 0.718 | 1.111 |
| 0.639999999999831 | 1.179 | 1.382 | 1.538 | 0.711 | 1.108 |
| 0.649999999999831 | 1.182 | 1.384 | 1.54 | 0.705 | 1.105 |
| 0.659999999999831 | 1.184 | 1.386 | 1.541 | 0.698 | 1.102 |
| 0.669999999999831 | 1.186 | 1.387 | 1.542 | 0.691 | 1.1 |
| 0.679999999999831 | 1.189 | 1.389 | 1.544 | 0.684 | 1.097 |
| 0.689999999999831 | 1.191 | 1.391 | 1.545 | 0.677 | 1.094 |
| 0.699999999999831 | 1.193 | 1.392 | 1.547 | 0.669 | 1.091 |
| 0.709999999999831 | 1.196 | 1.394 | 1.548 | 0.662 | 1.089 |
| 0.719999999999831 | 1.198 | 1.396 | 1.549 | 0.654 | 1.086 |
| 0.729999999999831 | 1.2 | 1.398 | 1.551 | 0.646 | 1.083 |
| 0.739999999999831 | 1.203 | 1.399 | 1.552 | 0.638 | 1.08 |
| 0.749999999999832 | 1.205 | 1.401 | 1.554 | 0.63 | 1.077 |
| 0.759999999999832 | 1.207 | 1.403 | 1.555 | 0.621 | 1.074 |
| 0.769999999999832 | 1.21 | 1.404 | 1.556 | 0.613 | 1.071 |
| 0.779999999999832 | 1.212 | 1.406 | 1.558 | 0.604 | 1.069 |
| 0.789999999999832 | 1.214 | 1.408 | 1.559 | 0.594 | 1.066 |
| 0.799999999999832 | 1.216 | 1.409 | 1.56 | 0.585 | 1.063 |
| 0.809999999999832 | 1.219 | 1.411 | 1.562 | 0.575 | 1.06 |
| 0.819999999999832 | 1.221 | 1.413 | 1.563 | 0.565 | 1.057 |
| 0.829999999999832 | 1.223 | 1.414 | 1.565 | 0.554 | 1.054 |
| 0.839999999999832 | 1.225 | 1.416 | 1.566 | 0.543 | 1.051 |
| 0.849999999999832 | 1.228 | 1.418 | 1.567 | 0.531 | 1.048 |
| 0.859999999999832 | 1.23 | 1.419 | 1.569 | 0.519 | 1.045 |
| 0.869999999999832 | 1.232 | 1.421 | 1.57 | 0.507 | 1.042 |
| 0.879999999999832 | 1.234 | 1.423 | 1.571 | 0.493 | 1.038 |
| 0.889999999999832 | 1.236 | 1.424 | 1.573 | 0.479 | 1.035 |
| 0.899999999999832 | 1.239 | 1.426 | 1.574 | 0.464 | 1.032 |
| 0.909999999999832 | 1.241 | 1.428 | 1.575 | 0.448 | 1.029 |
| 0.919999999999832 | 1.243 | 1.429 | 1.577 | 0.431 | 1.026 |
| 0.929999999999832 | 1.245 | 1.431 | 1.578 | 0.412 | 1.023 |
| 0.939999999999832 | 1.247 | 1.433 | 1.579 | 0.391 | 1.02 |
| 0.949999999999832 | 1.249 | 1.434 | 1.581 | 0.368 | 1.016 |
| 0.959999999999832 | 1.251 | 1.436 | 1.582 | 0.342 | 1.013 |
| 0.969999999999832 | 1.254 | 1.437 | 1.583 | 0.311 | 1.01 |
| 0.979999999999832 | 1.256 | 1.439 | 1.585 | 0.271 | 1.007 |
| 0.989999999999832 | 1.258 | 1.441 | 1.586 | 0.215 | 1.003 |
| 0.999999999999832 | 1.26 | 1.442 | 1.587 | 0 | 1 |
| 1.009999999999832 | 1.262 | 1.444 | 1.589 | -0.215 | 0.997 |
| 1.019999999999832 | 1.264 | 1.445 | 1.59 | -0.271 | 0.993 |
| 1.029999999999832 | 1.266 | 1.447 | 1.591 | -0.311 | 0.99 |
| 1.039999999999832 | 1.268 | 1.449 | 1.593 | -0.342 | 0.986 |
| 1.049999999999832 | 1.27 | 1.45 | 1.594 | -0.368 | 0.983 |
| 1.059999999999832 | 1.272 | 1.452 | 1.595 | -0.391 | 0.98 |
| 1.069999999999832 | 1.274 | 1.453 | 1.597 | -0.412 | 0.976 |
| 1.079999999999832 | 1.277 | 1.455 | 1.598 | -0.431 | 0.973 |
| 1.089999999999832 | 1.279 | 1.457 | 1.599 | -0.448 | 0.969 |
| 1.099999999999832 | 1.281 | 1.458 | 1.601 | -0.464 | 0.965 |
| 1.109999999999832 | 1.283 | 1.46 | 1.602 | -0.479 | 0.962 |
| 1.119999999999832 | 1.285 | 1.461 | 1.603 | -0.493 | 0.958 |
| 1.129999999999832 | 1.287 | 1.463 | 1.604 | -0.507 | 0.955 |
| 1.139999999999832 | 1.289 | 1.464 | 1.606 | -0.519 | 0.951 |
| 1.149999999999832 | 1.291 | 1.466 | 1.607 | -0.531 | 0.947 |
| 1.159999999999832 | 1.293 | 1.467 | 1.608 | -0.543 | 0.944 |
| 1.169999999999832 | 1.295 | 1.469 | 1.61 | -0.554 | 0.94 |
| 1.179999999999832 | 1.297 | 1.471 | 1.611 | -0.565 | 0.936 |
| 1.189999999999832 | 1.299 | 1.472 | 1.612 | -0.575 | 0.932 |
| 1.199999999999832 | 1.301 | 1.474 | 1.613 | -0.585 | 0.928 |
| 1.209999999999832 | 1.303 | 1.475 | 1.615 | -0.594 | 0.924 |
| 1.219999999999832 | 1.305 | 1.477 | 1.616 | -0.604 | 0.921 |
| 1.229999999999832 | 1.306 | 1.478 | 1.617 | -0.613 | 0.917 |
| 1.239999999999832 | 1.308 | 1.48 | 1.619 | -0.621 | 0.913 |
| 1.249999999999832 | 1.31 | 1.481 | 1.62 | -0.63 | 0.909 |
| 1.259999999999832 | 1.312 | 1.483 | 1.621 | -0.638 | 0.905 |
| 1.269999999999832 | 1.314 | 1.484 | 1.622 | -0.646 | 0.9 |
| 1.279999999999832 | 1.316 | 1.486 | 1.624 | -0.654 | 0.896 |
| 1.289999999999832 | 1.318 | 1.487 | 1.625 | -0.662 | 0.892 |
| 1.299999999999832 | 1.32 | 1.489 | 1.626 | -0.669 | 0.888 |
| 1.309999999999832 | 1.322 | 1.49 | 1.627 | -0.677 | 0.884 |
| 1.319999999999832 | 1.324 | 1.492 | 1.629 | -0.684 | 0.879 |
| 1.329999999999832 | 1.326 | 1.493 | 1.63 | -0.691 | 0.875 |
| 1.339999999999832 | 1.328 | 1.495 | 1.631 | -0.698 | 0.871 |
| 1.349999999999832 | 1.33 | 1.496 | 1.632 | -0.705 | 0.866 |
| 1.359999999999832 | 1.331 | 1.498 | 1.634 | -0.711 | 0.862 |
| 1.369999999999832 | 1.333 | 1.499 | 1.635 | -0.718 | 0.857 |
| 1.379999999999832 | 1.335 | 1.501 | 1.636 | -0.724 | 0.853 |
| 1.389999999999832 | 1.337 | 1.502 | 1.637 | -0.731 | 0.848 |
| 1.399999999999832 | 1.339 | 1.504 | 1.639 | -0.737 | 0.843 |
| 1.409999999999832 | 1.341 | 1.505 | 1.64 | -0.743 | 0.839 |
| 1.419999999999832 | 1.343 | 1.507 | 1.641 | -0.749 | 0.834 |
| 1.429999999999832 | 1.344 | 1.508 | 1.642 | -0.755 | 0.829 |
| 1.439999999999832 | 1.346 | 1.51 | 1.644 | -0.761 | 0.824 |
| 1.449999999999832 | 1.348 | 1.511 | 1.645 | -0.766 | 0.819 |
| 1.459999999999832 | 1.35 | 1.512 | 1.646 | -0.772 | 0.814 |
| 1.469999999999832 | 1.352 | 1.514 | 1.647 | -0.777 | 0.809 |
| 1.479999999999832 | 1.354 | 1.515 | 1.649 | -0.783 | 0.804 |
| 1.489999999999832 | 1.355 | 1.517 | 1.65 | -0.788 | 0.799 |
| 1.499999999999832 | 1.357 | 1.518 | 1.651 | -0.794 | 0.794 |
| 1.509999999999832 | 1.359 | 1.52 | 1.652 | -0.799 | 0.788 |
| 1.519999999999832 | 1.361 | 1.521 | 1.653 | -0.804 | 0.783 |
| 1.529999999999832 | 1.363 | 1.523 | 1.655 | -0.809 | 0.777 |
| 1.539999999999832 | 1.364 | 1.524 | 1.656 | -0.814 | 0.772 |
| 1.549999999999832 | 1.366 | 1.525 | 1.657 | -0.819 | 0.766 |
| 1.559999999999832 | 1.368 | 1.527 | 1.658 | -0.824 | 0.761 |
| 1.569999999999832 | 1.37 | 1.528 | 1.659 | -0.829 | 0.755 |
| 1.579999999999832 | 1.372 | 1.53 | 1.661 | -0.834 | 0.749 |
| 1.589999999999832 | 1.373 | 1.531 | 1.662 | -0.839 | 0.743 |
| 1.599999999999832 | 1.375 | 1.533 | 1.663 | -0.843 | 0.737 |
| 1.609999999999832 | 1.377 | 1.534 | 1.664 | -0.848 | 0.731 |
| 1.619999999999832 | 1.379 | 1.535 | 1.666 | -0.853 | 0.724 |
| 1.629999999999832 | 1.38 | 1.537 | 1.667 | -0.857 | 0.718 |
| 1.639999999999832 | 1.382 | 1.538 | 1.668 | -0.862 | 0.711 |
| 1.649999999999832 | 1.384 | 1.54 | 1.669 | -0.866 | 0.705 |
| 1.659999999999832 | 1.386 | 1.541 | 1.67 | -0.871 | 0.698 |
| 1.669999999999832 | 1.387 | 1.542 | 1.671 | -0.875 | 0.691 |
| 1.679999999999832 | 1.389 | 1.544 | 1.673 | -0.879 | 0.684 |
| 1.689999999999832 | 1.391 | 1.545 | 1.674 | -0.884 | 0.677 |
| 1.699999999999832 | 1.392 | 1.547 | 1.675 | -0.888 | 0.669 |
| 1.709999999999832 | 1.394 | 1.548 | 1.676 | -0.892 | 0.662 |
| 1.719999999999832 | 1.396 | 1.549 | 1.677 | -0.896 | 0.654 |
| 1.729999999999832 | 1.398 | 1.551 | 1.679 | -0.9 | 0.646 |
| 1.739999999999832 | 1.399 | 1.552 | 1.68 | -0.905 | 0.638 |
| 1.749999999999832 | 1.401 | 1.554 | 1.681 | -0.909 | 0.63 |
| 1.759999999999832 | 1.403 | 1.555 | 1.682 | -0.913 | 0.621 |
| 1.769999999999832 | 1.404 | 1.556 | 1.683 | -0.917 | 0.613 |
| 1.779999999999832 | 1.406 | 1.558 | 1.685 | -0.921 | 0.604 |
| 1.789999999999832 | 1.408 | 1.559 | 1.686 | -0.924 | 0.594 |
| 1.799999999999832 | 1.409 | 1.56 | 1.687 | -0.928 | 0.585 |
| 1.809999999999832 | 1.411 | 1.562 | 1.688 | -0.932 | 0.575 |
| 1.819999999999832 | 1.413 | 1.563 | 1.689 | -0.936 | 0.565 |
| 1.829999999999832 | 1.414 | 1.565 | 1.69 | -0.94 | 0.554 |
| 1.839999999999832 | 1.416 | 1.566 | 1.692 | -0.944 | 0.543 |
| 1.849999999999832 | 1.418 | 1.567 | 1.693 | -0.947 | 0.531 |
| 1.859999999999832 | 1.419 | 1.569 | 1.694 | -0.951 | 0.519 |
| 1.869999999999832 | 1.421 | 1.57 | 1.695 | -0.955 | 0.507 |
| 1.879999999999832 | 1.423 | 1.571 | 1.696 | -0.958 | 0.493 |
| 1.889999999999832 | 1.424 | 1.573 | 1.697 | -0.962 | 0.479 |
| 1.899999999999832 | 1.426 | 1.574 | 1.698 | -0.965 | 0.464 |
| 1.909999999999832 | 1.428 | 1.575 | 1.7 | -0.969 | 0.448 |
| 1.919999999999832 | 1.429 | 1.577 | 1.701 | -0.973 | 0.431 |
| 1.929999999999832 | 1.431 | 1.578 | 1.702 | -0.976 | 0.412 |
| 1.939999999999832 | 1.433 | 1.579 | 1.703 | -0.98 | 0.391 |
| 1.949999999999833 | 1.434 | 1.581 | 1.704 | -0.983 | 0.368 |
| 1.959999999999833 | 1.436 | 1.582 | 1.705 | -0.986 | 0.342 |
| 1.969999999999833 | 1.437 | 1.583 | 1.707 | -0.99 | 0.311 |
| 1.979999999999833 | 1.439 | 1.585 | 1.708 | -0.993 | 0.271 |
| 1.989999999999833 | 1.441 | 1.586 | 1.709 | -0.997 | 0.215 |
| 1.999999999999833 | 1.442 | 1.587 | 1.71 | -1 | 0 |
| 2.009999999999832 | 1.444 | 1.589 | 1.711 | -1.003 | -0.215 |
| 2.019999999999832 | 1.445 | 1.59 | 1.712 | -1.007 | -0.271 |
| 2.029999999999832 | 1.447 | 1.591 | 1.713 | -1.01 | -0.311 |
| 2.039999999999832 | 1.449 | 1.593 | 1.715 | -1.013 | -0.342 |
| 2.049999999999832 | 1.45 | 1.594 | 1.716 | -1.016 | -0.368 |
| 2.059999999999831 | 1.452 | 1.595 | 1.717 | -1.02 | -0.391 |
| 2.069999999999831 | 1.453 | 1.597 | 1.718 | -1.023 | -0.412 |
| 2.079999999999831 | 1.455 | 1.598 | 1.719 | -1.026 | -0.431 |
| 2.089999999999831 | 1.457 | 1.599 | 1.72 | -1.029 | -0.448 |
| 2.09999999999983 | 1.458 | 1.601 | 1.721 | -1.032 | -0.464 |
| 2.10999999999983 | 1.46 | 1.602 | 1.722 | -1.035 | -0.479 |
| 2.11999999999983 | 1.461 | 1.603 | 1.724 | -1.038 | -0.493 |
| 2.12999999999983 | 1.463 | 1.604 | 1.725 | -1.042 | -0.507 |
| 2.13999999999983 | 1.464 | 1.606 | 1.726 | -1.045 | -0.519 |
| 2.149999999999829 | 1.466 | 1.607 | 1.727 | -1.048 | -0.531 |
| 2.159999999999829 | 1.467 | 1.608 | 1.728 | -1.051 | -0.543 |
| 2.169999999999829 | 1.469 | 1.61 | 1.729 | -1.054 | -0.554 |
| 2.179999999999829 | 1.471 | 1.611 | 1.73 | -1.057 | -0.565 |
| 2.189999999999829 | 1.472 | 1.612 | 1.731 | -1.06 | -0.575 |
| 2.199999999999828 | 1.474 | 1.613 | 1.732 | -1.063 | -0.585 |
| 2.209999999999828 | 1.475 | 1.615 | 1.734 | -1.066 | -0.594 |
| 2.219999999999828 | 1.477 | 1.616 | 1.735 | -1.069 | -0.604 |
| 2.229999999999828 | 1.478 | 1.617 | 1.736 | -1.071 | -0.613 |
| 2.239999999999827 | 1.48 | 1.619 | 1.737 | -1.074 | -0.621 |
| 2.249999999999827 | 1.481 | 1.62 | 1.738 | -1.077 | -0.63 |
| 2.259999999999827 | 1.483 | 1.621 | 1.739 | -1.08 | -0.638 |
| 2.269999999999827 | 1.484 | 1.622 | 1.74 | -1.083 | -0.646 |
| 2.279999999999827 | 1.486 | 1.624 | 1.741 | -1.086 | -0.654 |
| 2.289999999999826 | 1.487 | 1.625 | 1.742 | -1.089 | -0.662 |
| 2.299999999999826 | 1.489 | 1.626 | 1.744 | -1.091 | -0.669 |
| 2.309999999999826 | 1.49 | 1.627 | 1.745 | -1.094 | -0.677 |
| 2.319999999999826 | 1.492 | 1.629 | 1.746 | -1.097 | -0.684 |
| 2.329999999999825 | 1.493 | 1.63 | 1.747 | -1.1 | -0.691 |
| 2.339999999999825 | 1.495 | 1.631 | 1.748 | -1.102 | -0.698 |
| 2.349999999999825 | 1.496 | 1.632 | 1.749 | -1.105 | -0.705 |
| 2.359999999999825 | 1.498 | 1.634 | 1.75 | -1.108 | -0.711 |
| 2.369999999999825 | 1.499 | 1.635 | 1.751 | -1.111 | -0.718 |
| 2.379999999999824 | 1.501 | 1.636 | 1.752 | -1.113 | -0.724 |
| 2.389999999999824 | 1.502 | 1.637 | 1.753 | -1.116 | -0.731 |
| 2.399999999999824 | 1.504 | 1.639 | 1.754 | -1.119 | -0.737 |
| 2.409999999999824 | 1.505 | 1.64 | 1.755 | -1.121 | -0.743 |
| 2.419999999999824 | 1.507 | 1.641 | 1.757 | -1.124 | -0.749 |
| 2.429999999999823 | 1.508 | 1.642 | 1.758 | -1.127 | -0.755 |
| 2.439999999999823 | 1.51 | 1.644 | 1.759 | -1.129 | -0.761 |
| 2.449999999999823 | 1.511 | 1.645 | 1.76 | -1.132 | -0.766 |
| 2.459999999999823 | 1.512 | 1.646 | 1.761 | -1.134 | -0.772 |
| 2.469999999999823 | 1.514 | 1.647 | 1.762 | -1.137 | -0.777 |
| 2.479999999999822 | 1.515 | 1.649 | 1.763 | -1.14 | -0.783 |
| 2.489999999999822 | 1.517 | 1.65 | 1.764 | -1.142 | -0.788 |
| 2.499999999999822 | 1.518 | 1.651 | 1.765 | -1.145 | -0.794 |
| 2.509999999999822 | 1.52 | 1.652 | 1.766 | -1.147 | -0.799 |
| 2.519999999999821 | 1.521 | 1.653 | 1.767 | -1.15 | -0.804 |
| 2.529999999999821 | 1.523 | 1.655 | 1.768 | -1.152 | -0.809 |
| 2.539999999999821 | 1.524 | 1.656 | 1.769 | -1.155 | -0.814 |
| 2.549999999999821 | 1.525 | 1.657 | 1.771 | -1.157 | -0.819 |
| 2.559999999999821 | 1.527 | 1.658 | 1.772 | -1.16 | -0.824 |
| 2.56999999999982 | 1.528 | 1.659 | 1.773 | -1.162 | -0.829 |
| 2.57999999999982 | 1.53 | 1.661 | 1.774 | -1.165 | -0.834 |
| 2.58999999999982 | 1.531 | 1.662 | 1.775 | -1.167 | -0.839 |
| 2.59999999999982 | 1.533 | 1.663 | 1.776 | -1.17 | -0.843 |
| 2.609999999999819 | 1.534 | 1.664 | 1.777 | -1.172 | -0.848 |
| 2.619999999999819 | 1.535 | 1.666 | 1.778 | -1.174 | -0.853 |
| 2.629999999999819 | 1.537 | 1.667 | 1.779 | -1.177 | -0.857 |
| 2.639999999999819 | 1.538 | 1.668 | 1.78 | -1.179 | -0.862 |
| 2.649999999999819 | 1.54 | 1.669 | 1.781 | -1.182 | -0.866 |
| 2.659999999999818 | 1.541 | 1.67 | 1.782 | -1.184 | -0.871 |
| 2.669999999999818 | 1.542 | 1.671 | 1.783 | -1.186 | -0.875 |
| 2.679999999999818 | 1.544 | 1.673 | 1.784 | -1.189 | -0.879 |
| 2.689999999999818 | 1.545 | 1.674 | 1.785 | -1.191 | -0.884 |
| 2.699999999999818 | 1.547 | 1.675 | 1.786 | -1.193 | -0.888 |
| 2.709999999999817 | 1.548 | 1.676 | 1.787 | -1.196 | -0.892 |
| 2.719999999999817 | 1.549 | 1.677 | 1.788 | -1.198 | -0.896 |
| 2.729999999999817 | 1.551 | 1.679 | 1.789 | -1.2 | -0.9 |
| 2.739999999999817 | 1.552 | 1.68 | 1.79 | -1.203 | -0.905 |
| 2.749999999999817 | 1.554 | 1.681 | 1.792 | -1.205 | -0.909 |
| 2.759999999999816 | 1.555 | 1.682 | 1.793 | -1.207 | -0.913 |
| 2.769999999999816 | 1.556 | 1.683 | 1.794 | -1.21 | -0.917 |
| 2.779999999999816 | 1.558 | 1.685 | 1.795 | -1.212 | -0.921 |
| 2.789999999999816 | 1.559 | 1.686 | 1.796 | -1.214 | -0.924 |
| 2.799999999999815 | 1.56 | 1.687 | 1.797 | -1.216 | -0.928 |
| 2.809999999999815 | 1.562 | 1.688 | 1.798 | -1.219 | -0.932 |
| 2.819999999999815 | 1.563 | 1.689 | 1.799 | -1.221 | -0.936 |
| 2.829999999999815 | 1.565 | 1.69 | 1.8 | -1.223 | -0.94 |
| 2.839999999999815 | 1.566 | 1.692 | 1.801 | -1.225 | -0.944 |
| 2.849999999999814 | 1.567 | 1.693 | 1.802 | -1.228 | -0.947 |
| 2.859999999999814 | 1.569 | 1.694 | 1.803 | -1.23 | -0.951 |
| 2.869999999999814 | 1.57 | 1.695 | 1.804 | -1.232 | -0.955 |
| 2.879999999999814 | 1.571 | 1.696 | 1.805 | -1.234 | -0.958 |
| 2.889999999999814 | 1.573 | 1.697 | 1.806 | -1.236 | -0.962 |
| 2.899999999999813 | 1.574 | 1.698 | 1.807 | -1.239 | -0.965 |
| 2.909999999999813 | 1.575 | 1.7 | 1.808 | -1.241 | -0.969 |
| 2.919999999999813 | 1.577 | 1.701 | 1.809 | -1.243 | -0.973 |
| 2.929999999999813 | 1.578 | 1.702 | 1.81 | -1.245 | -0.976 |
| 2.939999999999813 | 1.579 | 1.703 | 1.811 | -1.247 | -0.98 |
| 2.949999999999812 | 1.581 | 1.704 | 1.812 | -1.249 | -0.983 |
| 2.959999999999812 | 1.582 | 1.705 | 1.813 | -1.251 | -0.986 |
| 2.969999999999812 | 1.583 | 1.707 | 1.814 | -1.254 | -0.99 |
| 2.979999999999812 | 1.585 | 1.708 | 1.815 | -1.256 | -0.993 |
| 2.989999999999811 | 1.586 | 1.709 | 1.816 | -1.258 | -0.997 |
| 2.999999999999811 | 1.587 | 1.71 | 1.817 | -1.26 | -1 |
| 3.009999999999811 | 1.589 | 1.711 | 1.818 | -1.262 | -1.003 |
| 3.019999999999811 | 1.59 | 1.712 | 1.819 | -1.264 | -1.007 |
| 3.029999999999811 | 1.591 | 1.713 | 1.82 | -1.266 | -1.01 |
| 3.03999999999981 | 1.593 | 1.715 | 1.821 | -1.268 | -1.013 |
| 3.04999999999981 | 1.594 | 1.716 | 1.822 | -1.27 | -1.016 |
| 3.05999999999981 | 1.595 | 1.717 | 1.823 | -1.272 | -1.02 |
| 3.06999999999981 | 1.597 | 1.718 | 1.824 | -1.274 | -1.023 |
| 3.07999999999981 | 1.598 | 1.719 | 1.825 | -1.277 | -1.026 |
| 3.089999999999809 | 1.599 | 1.72 | 1.826 | -1.279 | -1.029 |
| 3.099999999999809 | 1.601 | 1.721 | 1.827 | -1.281 | -1.032 |
| 3.109999999999809 | 1.602 | 1.722 | 1.828 | -1.283 | -1.035 |
| 3.119999999999809 | 1.603 | 1.724 | 1.829 | -1.285 | -1.038 |
| 3.129999999999808 | 1.604 | 1.725 | 1.83 | -1.287 | -1.042 |
| 3.139999999999808 | 1.606 | 1.726 | 1.831 | -1.289 | -1.045 |
| 3.149999999999808 | 1.607 | 1.727 | 1.832 | -1.291 | -1.048 |
| 3.159999999999808 | 1.608 | 1.728 | 1.833 | -1.293 | -1.051 |
| 3.169999999999808 | 1.61 | 1.729 | 1.834 | -1.295 | -1.054 |
| 3.179999999999807 | 1.611 | 1.73 | 1.835 | -1.297 | -1.057 |
| 3.189999999999807 | 1.612 | 1.731 | 1.836 | -1.299 | -1.06 |
| 3.199999999999807 | 1.613 | 1.732 | 1.837 | -1.301 | -1.063 |
| 3.209999999999807 | 1.615 | 1.734 | 1.838 | -1.303 | -1.066 |
| 3.219999999999807 | 1.616 | 1.735 | 1.839 | -1.305 | -1.069 |
| 3.229999999999806 | 1.617 | 1.736 | 1.84 | -1.306 | -1.071 |
| 3.239999999999806 | 1.619 | 1.737 | 1.841 | -1.308 | -1.074 |
| 3.249999999999806 | 1.62 | 1.738 | 1.842 | -1.31 | -1.077 |
| 3.259999999999806 | 1.621 | 1.739 | 1.843 | -1.312 | -1.08 |
| 3.269999999999805 | 1.622 | 1.74 | 1.844 | -1.314 | -1.083 |
| 3.279999999999805 | 1.624 | 1.741 | 1.845 | -1.316 | -1.086 |
| 3.289999999999805 | 1.625 | 1.742 | 1.846 | -1.318 | -1.089 |
| 3.299999999999805 | 1.626 | 1.744 | 1.847 | -1.32 | -1.091 |
| 3.309999999999805 | 1.627 | 1.745 | 1.848 | -1.322 | -1.094 |
| 3.319999999999804 | 1.629 | 1.746 | 1.849 | -1.324 | -1.097 |
| 3.329999999999804 | 1.63 | 1.747 | 1.85 | -1.326 | -1.1 |
| 3.339999999999804 | 1.631 | 1.748 | 1.851 | -1.328 | -1.102 |
| 3.349999999999804 | 1.632 | 1.749 | 1.852 | -1.33 | -1.105 |
| 3.359999999999804 | 1.634 | 1.75 | 1.853 | -1.331 | -1.108 |
| 3.369999999999803 | 1.635 | 1.751 | 1.854 | -1.333 | -1.111 |
| 3.379999999999803 | 1.636 | 1.752 | 1.855 | -1.335 | -1.113 |
| 3.389999999999803 | 1.637 | 1.753 | 1.856 | -1.337 | -1.116 |
| 3.399999999999803 | 1.639 | 1.754 | 1.857 | -1.339 | -1.119 |
| 3.409999999999802 | 1.64 | 1.755 | 1.858 | -1.341 | -1.121 |
| 3.419999999999802 | 1.641 | 1.757 | 1.859 | -1.343 | -1.124 |
| 3.429999999999802 | 1.642 | 1.758 | 1.86 | -1.344 | -1.127 |
| 3.439999999999802 | 1.644 | 1.759 | 1.86 | -1.346 | -1.129 |
| 3.449999999999802 | 1.645 | 1.76 | 1.861 | -1.348 | -1.132 |
| 3.459999999999801 | 1.646 | 1.761 | 1.862 | -1.35 | -1.134 |
| 3.469999999999801 | 1.647 | 1.762 | 1.863 | -1.352 | -1.137 |
| 3.479999999999801 | 1.649 | 1.763 | 1.864 | -1.354 | -1.14 |
| 3.489999999999801 | 1.65 | 1.764 | 1.865 | -1.355 | -1.142 |
| 3.499999999999801 | 1.651 | 1.765 | 1.866 | -1.357 | -1.145 |
| 3.5099999999998 | 1.652 | 1.766 | 1.867 | -1.359 | -1.147 |
| 3.5199999999998 | 1.653 | 1.767 | 1.868 | -1.361 | -1.15 |
| 3.5299999999998 | 1.655 | 1.768 | 1.869 | -1.363 | -1.152 |
| 3.5399999999998 | 1.656 | 1.769 | 1.87 | -1.364 | -1.155 |
| 3.5499999999998 | 1.657 | 1.771 | 1.871 | -1.366 | -1.157 |
| 3.559999999999799 | 1.658 | 1.772 | 1.872 | -1.368 | -1.16 |
| 3.569999999999799 | 1.659 | 1.773 | 1.873 | -1.37 | -1.162 |
| 3.579999999999799 | 1.661 | 1.774 | 1.874 | -1.372 | -1.165 |
| 3.589999999999799 | 1.662 | 1.775 | 1.875 | -1.373 | -1.167 |
| 3.599999999999798 | 1.663 | 1.776 | 1.876 | -1.375 | -1.17 |
| 3.609999999999798 | 1.664 | 1.777 | 1.877 | -1.377 | -1.172 |
| 3.619999999999798 | 1.666 | 1.778 | 1.878 | -1.379 | -1.174 |
| 3.629999999999798 | 1.667 | 1.779 | 1.879 | -1.38 | -1.177 |
| 3.639999999999798 | 1.668 | 1.78 | 1.88 | -1.382 | -1.179 |
| 3.649999999999797 | 1.669 | 1.781 | 1.881 | -1.384 | -1.182 |
| 3.659999999999797 | 1.67 | 1.782 | 1.881 | -1.386 | -1.184 |
| 3.669999999999797 | 1.671 | 1.783 | 1.882 | -1.387 | -1.186 |
| 3.679999999999797 | 1.673 | 1.784 | 1.883 | -1.389 | -1.189 |
| 3.689999999999796 | 1.674 | 1.785 | 1.884 | -1.391 | -1.191 |
| 3.699999999999796 | 1.675 | 1.786 | 1.885 | -1.392 | -1.193 |
| 3.709999999999796 | 1.676 | 1.787 | 1.886 | -1.394 | -1.196 |
| 3.719999999999796 | 1.677 | 1.788 | 1.887 | -1.396 | -1.198 |
| 3.729999999999796 | 1.679 | 1.789 | 1.888 | -1.398 | -1.2 |
| 3.739999999999795 | 1.68 | 1.79 | 1.889 | -1.399 | -1.203 |
| 3.749999999999795 | 1.681 | 1.792 | 1.89 | -1.401 | -1.205 |
| 3.759999999999795 | 1.682 | 1.793 | 1.891 | -1.403 | -1.207 |
| 3.769999999999795 | 1.683 | 1.794 | 1.892 | -1.404 | -1.21 |
| 3.779999999999795 | 1.685 | 1.795 | 1.893 | -1.406 | -1.212 |
| 3.789999999999794 | 1.686 | 1.796 | 1.894 | -1.408 | -1.214 |
| 3.799999999999794 | 1.687 | 1.797 | 1.895 | -1.409 | -1.216 |
| 3.809999999999794 | 1.688 | 1.798 | 1.895 | -1.411 | -1.219 |
| 3.819999999999794 | 1.689 | 1.799 | 1.896 | -1.413 | -1.221 |
| 3.829999999999794 | 1.69 | 1.8 | 1.897 | -1.414 | -1.223 |
| 3.839999999999793 | 1.692 | 1.801 | 1.898 | -1.416 | -1.225 |
| 3.849999999999793 | 1.693 | 1.802 | 1.899 | -1.418 | -1.228 |
| 3.859999999999793 | 1.694 | 1.803 | 1.9 | -1.419 | -1.23 |
| 3.869999999999793 | 1.695 | 1.804 | 1.901 | -1.421 | -1.232 |
| 3.879999999999792 | 1.696 | 1.805 | 1.902 | -1.423 | -1.234 |
| 3.889999999999792 | 1.697 | 1.806 | 1.903 | -1.424 | -1.236 |
| 3.899999999999792 | 1.698 | 1.807 | 1.904 | -1.426 | -1.239 |
| 3.909999999999792 | 1.7 | 1.808 | 1.905 | -1.428 | -1.241 |
| 3.919999999999792 | 1.701 | 1.809 | 1.906 | -1.429 | -1.243 |
| 3.929999999999791 | 1.702 | 1.81 | 1.907 | -1.431 | -1.245 |
| 3.939999999999791 | 1.703 | 1.811 | 1.907 | -1.433 | -1.247 |
| 3.949999999999791 | 1.704 | 1.812 | 1.908 | -1.434 | -1.249 |
| 3.959999999999791 | 1.705 | 1.813 | 1.909 | -1.436 | -1.251 |
| 3.969999999999791 | 1.707 | 1.814 | 1.91 | -1.437 | -1.254 |
| 3.97999999999979 | 1.708 | 1.815 | 1.911 | -1.439 | -1.256 |
| 3.98999999999979 | 1.709 | 1.816 | 1.912 | -1.441 | -1.258 |
| 3.99999999999979 | 1.71 | 1.817 | 1.913 | -1.442 | -1.26 |
| 4.00999999999979 | 1.711 | 1.818 | 1.914 | -1.444 | -1.262 |
| 4.01999999999979 | 1.712 | 1.819 | 1.915 | -1.445 | -1.264 |
| 4.02999999999979 | 1.713 | 1.82 | 1.916 | -1.447 | -1.266 |
| 4.03999999999979 | 1.715 | 1.821 | 1.917 | -1.449 | -1.268 |
| 4.04999999999979 | 1.716 | 1.822 | 1.917 | -1.45 | -1.27 |
| 4.05999999999979 | 1.717 | 1.823 | 1.918 | -1.452 | -1.272 |
| 4.069999999999789 | 1.718 | 1.824 | 1.919 | -1.453 | -1.274 |
| 4.079999999999788 | 1.719 | 1.825 | 1.92 | -1.455 | -1.277 |
| 4.089999999999788 | 1.72 | 1.826 | 1.921 | -1.457 | -1.279 |
| 4.099999999999788 | 1.721 | 1.827 | 1.922 | -1.458 | -1.281 |
| 4.109999999999788 | 1.722 | 1.828 | 1.923 | -1.46 | -1.283 |
| 4.119999999999788 | 1.724 | 1.829 | 1.924 | -1.461 | -1.285 |
| 4.129999999999788 | 1.725 | 1.83 | 1.925 | -1.463 | -1.287 |
| 4.139999999999787 | 1.726 | 1.831 | 1.926 | -1.464 | -1.289 |
| 4.149999999999787 | 1.727 | 1.832 | 1.926 | -1.466 | -1.291 |
| 4.159999999999787 | 1.728 | 1.833 | 1.927 | -1.467 | -1.293 |
| 4.169999999999787 | 1.729 | 1.834 | 1.928 | -1.469 | -1.295 |
| 4.179999999999786 | 1.73 | 1.835 | 1.929 | -1.471 | -1.297 |
| 4.189999999999786 | 1.731 | 1.836 | 1.93 | -1.472 | -1.299 |
| 4.199999999999786 | 1.732 | 1.837 | 1.931 | -1.474 | -1.301 |
| 4.209999999999785 | 1.734 | 1.838 | 1.932 | -1.475 | -1.303 |
| 4.219999999999785 | 1.735 | 1.839 | 1.933 | -1.477 | -1.305 |
| 4.229999999999785 | 1.736 | 1.84 | 1.934 | -1.478 | -1.306 |
| 4.239999999999785 | 1.737 | 1.841 | 1.935 | -1.48 | -1.308 |
| 4.249999999999785 | 1.738 | 1.842 | 1.935 | -1.481 | -1.31 |
| 4.259999999999784 | 1.739 | 1.843 | 1.936 | -1.483 | -1.312 |
| 4.269999999999784 | 1.74 | 1.844 | 1.937 | -1.484 | -1.314 |
| 4.279999999999784 | 1.741 | 1.845 | 1.938 | -1.486 | -1.316 |
| 4.289999999999784 | 1.742 | 1.846 | 1.939 | -1.487 | -1.318 |
| 4.299999999999784 | 1.744 | 1.847 | 1.94 | -1.489 | -1.32 |
| 4.309999999999784 | 1.745 | 1.848 | 1.941 | -1.49 | -1.322 |
| 4.319999999999784 | 1.746 | 1.849 | 1.942 | -1.492 | -1.324 |
| 4.329999999999783 | 1.747 | 1.85 | 1.943 | -1.493 | -1.326 |
| 4.339999999999783 | 1.748 | 1.851 | 1.943 | -1.495 | -1.328 |
| 4.349999999999783 | 1.749 | 1.852 | 1.944 | -1.496 | -1.33 |
| 4.359999999999783 | 1.75 | 1.853 | 1.945 | -1.498 | -1.331 |
| 4.369999999999782 | 1.751 | 1.854 | 1.946 | -1.499 | -1.333 |
| 4.379999999999782 | 1.752 | 1.855 | 1.947 | -1.501 | -1.335 |
| 4.389999999999782 | 1.753 | 1.856 | 1.948 | -1.502 | -1.337 |
| 4.399999999999782 | 1.754 | 1.857 | 1.949 | -1.504 | -1.339 |
| 4.409999999999781 | 1.755 | 1.858 | 1.95 | -1.505 | -1.341 |
| 4.419999999999781 | 1.757 | 1.859 | 1.95 | -1.507 | -1.343 |
| 4.429999999999781 | 1.758 | 1.86 | 1.951 | -1.508 | -1.344 |
| 4.43999999999978 | 1.759 | 1.86 | 1.952 | -1.51 | -1.346 |
| 4.44999999999978 | 1.76 | 1.861 | 1.953 | -1.511 | -1.348 |
| 4.45999999999978 | 1.761 | 1.862 | 1.954 | -1.512 | -1.35 |
| 4.46999999999978 | 1.762 | 1.863 | 1.955 | -1.514 | -1.352 |
| 4.47999999999978 | 1.763 | 1.864 | 1.956 | -1.515 | -1.354 |
| 4.48999999999978 | 1.764 | 1.865 | 1.957 | -1.517 | -1.355 |
| 4.49999999999978 | 1.765 | 1.866 | 1.957 | -1.518 | -1.357 |
| 4.50999999999978 | 1.766 | 1.867 | 1.958 | -1.52 | -1.359 |
| 4.51999999999978 | 1.767 | 1.868 | 1.959 | -1.521 | -1.361 |
| 4.52999999999978 | 1.768 | 1.869 | 1.96 | -1.523 | -1.363 |
| 4.539999999999778 | 1.769 | 1.87 | 1.961 | -1.524 | -1.364 |
| 4.549999999999778 | 1.771 | 1.871 | 1.962 | -1.525 | -1.366 |
| 4.559999999999778 | 1.772 | 1.872 | 1.963 | -1.527 | -1.368 |
| 4.569999999999778 | 1.773 | 1.873 | 1.964 | -1.528 | -1.37 |
| 4.579999999999778 | 1.774 | 1.874 | 1.964 | -1.53 | -1.372 |
| 4.589999999999777 | 1.775 | 1.875 | 1.965 | -1.531 | -1.373 |
| 4.599999999999777 | 1.776 | 1.876 | 1.966 | -1.533 | -1.375 |
| 4.609999999999777 | 1.777 | 1.877 | 1.967 | -1.534 | -1.377 |
| 4.619999999999777 | 1.778 | 1.878 | 1.968 | -1.535 | -1.379 |
| 4.629999999999777 | 1.779 | 1.879 | 1.969 | -1.537 | -1.38 |
| 4.639999999999776 | 1.78 | 1.88 | 1.97 | -1.538 | -1.382 |
| 4.649999999999776 | 1.781 | 1.881 | 1.97 | -1.54 | -1.384 |
| 4.659999999999776 | 1.782 | 1.881 | 1.971 | -1.541 | -1.386 |
| 4.669999999999776 | 1.783 | 1.882 | 1.972 | -1.542 | -1.387 |
| 4.679999999999775 | 1.784 | 1.883 | 1.973 | -1.544 | -1.389 |
| 4.689999999999775 | 1.785 | 1.884 | 1.974 | -1.545 | -1.391 |
| 4.699999999999775 | 1.786 | 1.885 | 1.975 | -1.547 | -1.392 |
| 4.709999999999775 | 1.787 | 1.886 | 1.976 | -1.548 | -1.394 |
| 4.719999999999774 | 1.788 | 1.887 | 1.976 | -1.549 | -1.396 |
| 4.729999999999774 | 1.789 | 1.888 | 1.977 | -1.551 | -1.398 |
| 4.739999999999774 | 1.79 | 1.889 | 1.978 | -1.552 | -1.399 |
| 4.749999999999774 | 1.792 | 1.89 | 1.979 | -1.554 | -1.401 |
| 4.759999999999774 | 1.793 | 1.891 | 1.98 | -1.555 | -1.403 |
| 4.769999999999774 | 1.794 | 1.892 | 1.981 | -1.556 | -1.404 |
| 4.779999999999773 | 1.795 | 1.893 | 1.981 | -1.558 | -1.406 |
| 4.789999999999773 | 1.796 | 1.894 | 1.982 | -1.559 | -1.408 |
| 4.799999999999773 | 1.797 | 1.895 | 1.983 | -1.56 | -1.409 |
| 4.809999999999773 | 1.798 | 1.895 | 1.984 | -1.562 | -1.411 |
| 4.819999999999773 | 1.799 | 1.896 | 1.985 | -1.563 | -1.413 |
| 4.829999999999773 | 1.8 | 1.897 | 1.986 | -1.565 | -1.414 |
| 4.839999999999772 | 1.801 | 1.898 | 1.987 | -1.566 | -1.416 |
| 4.849999999999772 | 1.802 | 1.899 | 1.987 | -1.567 | -1.418 |
| 4.859999999999772 | 1.803 | 1.9 | 1.988 | -1.569 | -1.419 |
| 4.869999999999772 | 1.804 | 1.901 | 1.989 | -1.57 | -1.421 |
| 4.879999999999771 | 1.805 | 1.902 | 1.99 | -1.571 | -1.423 |
| 4.889999999999771 | 1.806 | 1.903 | 1.991 | -1.573 | -1.424 |
| 4.899999999999771 | 1.807 | 1.904 | 1.992 | -1.574 | -1.426 |
| 4.90999999999977 | 1.808 | 1.905 | 1.992 | -1.575 | -1.428 |
| 4.91999999999977 | 1.809 | 1.906 | 1.993 | -1.577 | -1.429 |
| 4.92999999999977 | 1.81 | 1.907 | 1.994 | -1.578 | -1.431 |
| 4.93999999999977 | 1.811 | 1.907 | 1.995 | -1.579 | -1.433 |
| 4.94999999999977 | 1.812 | 1.908 | 1.996 | -1.581 | -1.434 |
| 4.95999999999977 | 1.813 | 1.909 | 1.997 | -1.582 | -1.436 |
| 4.96999999999977 | 1.814 | 1.91 | 1.997 | -1.583 | -1.437 |
| 4.97999999999977 | 1.815 | 1.911 | 1.998 | -1.585 | -1.439 |
| 4.98999999999977 | 1.816 | 1.912 | 1.999 | -1.586 | -1.441 |
| 4.99999999999977 | 1.817 | 1.913 | 2 | -1.587 | -1.442 |
| 5.009999999999768 | 1.818 | 1.914 | 2.001 | -1.589 | -1.444 |
| 5.019999999999768 | 1.819 | 1.915 | 2.002 | -1.59 | -1.445 |
| 5.029999999999768 | 1.82 | 1.916 | 2.002 | -1.591 | -1.447 |
| 5.039999999999768 | 1.821 | 1.917 | 2.003 | -1.593 | -1.449 |
| 5.049999999999767 | 1.822 | 1.917 | 2.004 | -1.594 | -1.45 |
| 5.059999999999767 | 1.823 | 1.918 | 2.005 | -1.595 | -1.452 |
| 5.069999999999767 | 1.824 | 1.919 | 2.006 | -1.597 | -1.453 |
| 5.079999999999767 | 1.825 | 1.92 | 2.007 | -1.598 | -1.455 |
| 5.089999999999767 | 1.826 | 1.921 | 2.007 | -1.599 | -1.457 |
| 5.099999999999766 | 1.827 | 1.922 | 2.008 | -1.601 | -1.458 |
| 5.109999999999766 | 1.828 | 1.923 | 2.009 | -1.602 | -1.46 |
| 5.119999999999766 | 1.829 | 1.924 | 2.01 | -1.603 | -1.461 |
| 5.129999999999766 | 1.83 | 1.925 | 2.011 | -1.604 | -1.463 |
| 5.139999999999766 | 1.831 | 1.926 | 2.012 | -1.606 | -1.464 |
| 5.149999999999765 | 1.832 | 1.926 | 2.012 | -1.607 | -1.466 |
| 5.159999999999765 | 1.833 | 1.927 | 2.013 | -1.608 | -1.467 |
| 5.169999999999765 | 1.834 | 1.928 | 2.014 | -1.61 | -1.469 |
| 5.179999999999765 | 1.835 | 1.929 | 2.015 | -1.611 | -1.471 |
| 5.189999999999764 | 1.836 | 1.93 | 2.016 | -1.612 | -1.472 |
| 5.199999999999764 | 1.837 | 1.931 | 2.017 | -1.613 | -1.474 |
| 5.209999999999764 | 1.838 | 1.932 | 2.017 | -1.615 | -1.475 |
| 5.219999999999764 | 1.839 | 1.933 | 2.018 | -1.616 | -1.477 |
| 5.229999999999764 | 1.84 | 1.934 | 2.019 | -1.617 | -1.478 |
| 5.239999999999763 | 1.841 | 1.935 | 2.02 | -1.619 | -1.48 |
| 5.249999999999763 | 1.842 | 1.935 | 2.021 | -1.62 | -1.481 |
| 5.259999999999763 | 1.843 | 1.936 | 2.021 | -1.621 | -1.483 |
| 5.269999999999763 | 1.844 | 1.937 | 2.022 | -1.622 | -1.484 |
| 5.279999999999763 | 1.845 | 1.938 | 2.023 | -1.624 | -1.486 |
| 5.289999999999762 | 1.846 | 1.939 | 2.024 | -1.625 | -1.487 |
| 5.299999999999762 | 1.847 | 1.94 | 2.025 | -1.626 | -1.489 |
| 5.309999999999762 | 1.848 | 1.941 | 2.026 | -1.627 | -1.49 |
| 5.319999999999762 | 1.849 | 1.942 | 2.026 | -1.629 | -1.492 |
| 5.329999999999762 | 1.85 | 1.943 | 2.027 | -1.63 | -1.493 |
| 5.339999999999761 | 1.851 | 1.943 | 2.028 | -1.631 | -1.495 |
| 5.349999999999761 | 1.852 | 1.944 | 2.029 | -1.632 | -1.496 |
| 5.359999999999761 | 1.853 | 1.945 | 2.03 | -1.634 | -1.498 |
| 5.369999999999761 | 1.854 | 1.946 | 2.03 | -1.635 | -1.499 |
| 5.37999999999976 | 1.855 | 1.947 | 2.031 | -1.636 | -1.501 |
| 5.38999999999976 | 1.856 | 1.948 | 2.032 | -1.637 | -1.502 |
| 5.39999999999976 | 1.857 | 1.949 | 2.033 | -1.639 | -1.504 |
| 5.40999999999976 | 1.858 | 1.95 | 2.034 | -1.64 | -1.505 |
| 5.41999999999976 | 1.859 | 1.95 | 2.034 | -1.641 | -1.507 |
| 5.42999999999976 | 1.86 | 1.951 | 2.035 | -1.642 | -1.508 |
| 5.43999999999976 | 1.86 | 1.952 | 2.036 | -1.644 | -1.51 |
| 5.44999999999976 | 1.861 | 1.953 | 2.037 | -1.645 | -1.511 |
| 5.45999999999976 | 1.862 | 1.954 | 2.038 | -1.646 | -1.512 |
| 5.46999999999976 | 1.863 | 1.955 | 2.038 | -1.647 | -1.514 |
| 5.479999999999758 | 1.864 | 1.956 | 2.039 | -1.649 | -1.515 |
| 5.489999999999758 | 1.865 | 1.957 | 2.04 | -1.65 | -1.517 |
| 5.499999999999758 | 1.866 | 1.957 | 2.041 | -1.651 | -1.518 |
| 5.509999999999758 | 1.867 | 1.958 | 2.042 | -1.652 | -1.52 |
| 5.519999999999758 | 1.868 | 1.959 | 2.042 | -1.653 | -1.521 |
| 5.529999999999758 | 1.869 | 1.96 | 2.043 | -1.655 | -1.523 |
| 5.539999999999757 | 1.87 | 1.961 | 2.044 | -1.656 | -1.524 |
| 5.549999999999757 | 1.871 | 1.962 | 2.045 | -1.657 | -1.525 |
| 5.559999999999757 | 1.872 | 1.963 | 2.046 | -1.658 | -1.527 |
| 5.569999999999757 | 1.873 | 1.964 | 2.046 | -1.659 | -1.528 |
| 5.579999999999756 | 1.874 | 1.964 | 2.047 | -1.661 | -1.53 |
| 5.589999999999756 | 1.875 | 1.965 | 2.048 | -1.662 | -1.531 |
| 5.599999999999756 | 1.876 | 1.966 | 2.049 | -1.663 | -1.533 |
| 5.609999999999756 | 1.877 | 1.967 | 2.05 | -1.664 | -1.534 |
| 5.619999999999756 | 1.878 | 1.968 | 2.05 | -1.666 | -1.535 |
| 5.629999999999756 | 1.879 | 1.969 | 2.051 | -1.667 | -1.537 |
| 5.639999999999755 | 1.88 | 1.97 | 2.052 | -1.668 | -1.538 |
| 5.649999999999755 | 1.881 | 1.97 | 2.053 | -1.669 | -1.54 |
| 5.659999999999755 | 1.881 | 1.971 | 2.054 | -1.67 | -1.541 |
| 5.669999999999755 | 1.882 | 1.972 | 2.054 | -1.671 | -1.542 |
| 5.679999999999754 | 1.883 | 1.973 | 2.055 | -1.673 | -1.544 |
| 5.689999999999754 | 1.884 | 1.974 | 2.056 | -1.674 | -1.545 |
| 5.699999999999754 | 1.885 | 1.975 | 2.057 | -1.675 | -1.547 |
| 5.709999999999754 | 1.886 | 1.976 | 2.057 | -1.676 | -1.548 |
| 5.719999999999754 | 1.887 | 1.976 | 2.058 | -1.677 | -1.549 |
| 5.729999999999753 | 1.888 | 1.977 | 2.059 | -1.679 | -1.551 |
| 5.739999999999753 | 1.889 | 1.978 | 2.06 | -1.68 | -1.552 |
| 5.749999999999753 | 1.89 | 1.979 | 2.061 | -1.681 | -1.554 |
| 5.759999999999753 | 1.891 | 1.98 | 2.061 | -1.682 | -1.555 |
| 5.769999999999753 | 1.892 | 1.981 | 2.062 | -1.683 | -1.556 |
| 5.779999999999752 | 1.893 | 1.981 | 2.063 | -1.685 | -1.558 |
| 5.789999999999752 | 1.894 | 1.982 | 2.064 | -1.686 | -1.559 |
| 5.799999999999752 | 1.895 | 1.983 | 2.065 | -1.687 | -1.56 |
| 5.809999999999752 | 1.895 | 1.984 | 2.065 | -1.688 | -1.562 |
| 5.819999999999752 | 1.896 | 1.985 | 2.066 | -1.689 | -1.563 |
| 5.829999999999751 | 1.897 | 1.986 | 2.067 | -1.69 | -1.565 |
| 5.839999999999751 | 1.898 | 1.987 | 2.068 | -1.692 | -1.566 |
| 5.849999999999751 | 1.899 | 1.987 | 2.068 | -1.693 | -1.567 |
| 5.859999999999751 | 1.9 | 1.988 | 2.069 | -1.694 | -1.569 |
| 5.86999999999975 | 1.901 | 1.989 | 2.07 | -1.695 | -1.57 |
| 5.87999999999975 | 1.902 | 1.99 | 2.071 | -1.696 | -1.571 |
| 5.88999999999975 | 1.903 | 1.991 | 2.072 | -1.697 | -1.573 |
| 5.89999999999975 | 1.904 | 1.992 | 2.072 | -1.698 | -1.574 |
| 5.90999999999975 | 1.905 | 1.992 | 2.073 | -1.7 | -1.575 |
| 5.91999999999975 | 1.906 | 1.993 | 2.074 | -1.701 | -1.577 |
| 5.92999999999975 | 1.907 | 1.994 | 2.075 | -1.702 | -1.578 |
| 5.93999999999975 | 1.907 | 1.995 | 2.075 | -1.703 | -1.579 |
| 5.949999999999748 | 1.908 | 1.996 | 2.076 | -1.704 | -1.581 |
| 5.959999999999748 | 1.909 | 1.997 | 2.077 | -1.705 | -1.582 |
| 5.969999999999748 | 1.91 | 1.997 | 2.078 | -1.707 | -1.583 |
| 5.979999999999748 | 1.911 | 1.998 | 2.079 | -1.708 | -1.585 |
| 5.989999999999747 | 1.912 | 1.999 | 2.079 | -1.709 | -1.586 |
| 5.999999999999747 | 1.913 | 2 | 2.08 | -1.71 | -1.587 |
| 6.009999999999747 | 1.914 | 2.001 | 2.081 | -1.711 | -1.589 |
| 6.019999999999747 | 1.915 | 2.002 | 2.082 | -1.712 | -1.59 |
| 6.029999999999747 | 1.916 | 2.002 | 2.082 | -1.713 | -1.591 |
| 6.039999999999746 | 1.917 | 2.003 | 2.083 | -1.715 | -1.593 |
| 6.049999999999746 | 1.917 | 2.004 | 2.084 | -1.716 | -1.594 |
| 6.059999999999746 | 1.918 | 2.005 | 2.085 | -1.717 | -1.595 |
| 6.069999999999746 | 1.919 | 2.006 | 2.085 | -1.718 | -1.597 |
| 6.079999999999746 | 1.92 | 2.007 | 2.086 | -1.719 | -1.598 |
| 6.089999999999745 | 1.921 | 2.007 | 2.087 | -1.72 | -1.599 |
| 6.099999999999745 | 1.922 | 2.008 | 2.088 | -1.721 | -1.601 |
| 6.109999999999745 | 1.923 | 2.009 | 2.089 | -1.722 | -1.602 |
| 6.119999999999745 | 1.924 | 2.01 | 2.089 | -1.724 | -1.603 |
| 6.129999999999745 | 1.925 | 2.011 | 2.09 | -1.725 | -1.604 |
| 6.139999999999744 | 1.926 | 2.012 | 2.091 | -1.726 | -1.606 |
| 6.149999999999744 | 1.926 | 2.012 | 2.092 | -1.727 | -1.607 |
| 6.159999999999744 | 1.927 | 2.013 | 2.092 | -1.728 | -1.608 |
| 6.169999999999744 | 1.928 | 2.014 | 2.093 | -1.729 | -1.61 |
| 6.179999999999744 | 1.929 | 2.015 | 2.094 | -1.73 | -1.611 |
| 6.189999999999744 | 1.93 | 2.016 | 2.095 | -1.731 | -1.612 |
| 6.199999999999743 | 1.931 | 2.017 | 2.095 | -1.732 | -1.613 |
| 6.209999999999743 | 1.932 | 2.017 | 2.096 | -1.734 | -1.615 |
| 6.219999999999743 | 1.933 | 2.018 | 2.097 | -1.735 | -1.616 |
| 6.229999999999743 | 1.934 | 2.019 | 2.098 | -1.736 | -1.617 |
| 6.239999999999742 | 1.935 | 2.02 | 2.098 | -1.737 | -1.619 |
| 6.249999999999742 | 1.935 | 2.021 | 2.099 | -1.738 | -1.62 |
| 6.259999999999742 | 1.936 | 2.021 | 2.1 | -1.739 | -1.621 |
| 6.269999999999742 | 1.937 | 2.022 | 2.101 | -1.74 | -1.622 |
| 6.279999999999741 | 1.938 | 2.023 | 2.101 | -1.741 | -1.624 |
| 6.289999999999741 | 1.939 | 2.024 | 2.102 | -1.742 | -1.625 |
| 6.299999999999741 | 1.94 | 2.025 | 2.103 | -1.744 | -1.626 |
| 6.309999999999741 | 1.941 | 2.026 | 2.104 | -1.745 | -1.627 |
| 6.319999999999741 | 1.942 | 2.026 | 2.104 | -1.746 | -1.629 |
| 6.329999999999741 | 1.943 | 2.027 | 2.105 | -1.747 | -1.63 |
| 6.33999999999974 | 1.943 | 2.028 | 2.106 | -1.748 | -1.631 |
| 6.34999999999974 | 1.944 | 2.029 | 2.107 | -1.749 | -1.632 |
| 6.35999999999974 | 1.945 | 2.03 | 2.107 | -1.75 | -1.634 |
| 6.36999999999974 | 1.946 | 2.03 | 2.108 | -1.751 | -1.635 |
| 6.37999999999974 | 1.947 | 2.031 | 2.109 | -1.752 | -1.636 |
| 6.38999999999974 | 1.948 | 2.032 | 2.11 | -1.753 | -1.637 |
| 6.39999999999974 | 1.949 | 2.033 | 2.11 | -1.754 | -1.639 |
| 6.409999999999738 | 1.95 | 2.034 | 2.111 | -1.755 | -1.64 |
| 6.419999999999738 | 1.95 | 2.034 | 2.112 | -1.757 | -1.641 |
| 6.429999999999738 | 1.951 | 2.035 | 2.113 | -1.758 | -1.642 |
| 6.439999999999738 | 1.952 | 2.036 | 2.113 | -1.759 | -1.644 |
| 6.449999999999738 | 1.953 | 2.037 | 2.114 | -1.76 | -1.645 |
| 6.459999999999737 | 1.954 | 2.038 | 2.115 | -1.761 | -1.646 |
| 6.469999999999737 | 1.955 | 2.038 | 2.116 | -1.762 | -1.647 |
| 6.479999999999737 | 1.956 | 2.039 | 2.116 | -1.763 | -1.649 |
| 6.489999999999737 | 1.957 | 2.04 | 2.117 | -1.764 | -1.65 |
| 6.499999999999737 | 1.957 | 2.041 | 2.118 | -1.765 | -1.651 |
| 6.509999999999736 | 1.958 | 2.042 | 2.119 | -1.766 | -1.652 |
| 6.519999999999736 | 1.959 | 2.042 | 2.119 | -1.767 | -1.653 |
| 6.529999999999736 | 1.96 | 2.043 | 2.12 | -1.768 | -1.655 |
| 6.539999999999736 | 1.961 | 2.044 | 2.121 | -1.769 | -1.656 |
| 6.549999999999736 | 1.962 | 2.045 | 2.122 | -1.771 | -1.657 |
| 6.559999999999735 | 1.963 | 2.046 | 2.122 | -1.772 | -1.658 |
| 6.569999999999735 | 1.964 | 2.046 | 2.123 | -1.773 | -1.659 |
| 6.579999999999735 | 1.964 | 2.047 | 2.124 | -1.774 | -1.661 |
| 6.589999999999735 | 1.965 | 2.048 | 2.125 | -1.775 | -1.662 |
| 6.599999999999734 | 1.966 | 2.049 | 2.125 | -1.776 | -1.663 |
| 6.609999999999734 | 1.967 | 2.05 | 2.126 | -1.777 | -1.664 |
| 6.619999999999734 | 1.968 | 2.05 | 2.127 | -1.778 | -1.666 |
| 6.629999999999734 | 1.969 | 2.051 | 2.128 | -1.779 | -1.667 |
| 6.639999999999734 | 1.97 | 2.052 | 2.128 | -1.78 | -1.668 |
| 6.649999999999734 | 1.97 | 2.053 | 2.129 | -1.781 | -1.669 |
| 6.659999999999734 | 1.971 | 2.054 | 2.13 | -1.782 | -1.67 |
| 6.669999999999733 | 1.972 | 2.054 | 2.13 | -1.783 | -1.671 |
| 6.679999999999733 | 1.973 | 2.055 | 2.131 | -1.784 | -1.673 |
| 6.689999999999733 | 1.974 | 2.056 | 2.132 | -1.785 | -1.674 |
| 6.699999999999733 | 1.975 | 2.057 | 2.133 | -1.786 | -1.675 |
| 6.709999999999732 | 1.976 | 2.057 | 2.133 | -1.787 | -1.676 |
| 6.719999999999732 | 1.976 | 2.058 | 2.134 | -1.788 | -1.677 |
| 6.729999999999732 | 1.977 | 2.059 | 2.135 | -1.789 | -1.679 |
| 6.739999999999731 | 1.978 | 2.06 | 2.136 | -1.79 | -1.68 |
| 6.749999999999731 | 1.979 | 2.061 | 2.136 | -1.792 | -1.681 |
| 6.759999999999731 | 1.98 | 2.061 | 2.137 | -1.793 | -1.682 |
| 6.769999999999731 | 1.981 | 2.062 | 2.138 | -1.794 | -1.683 |
| 6.77999999999973 | 1.981 | 2.063 | 2.139 | -1.795 | -1.685 |
| 6.78999999999973 | 1.982 | 2.064 | 2.139 | -1.796 | -1.686 |
| 6.79999999999973 | 1.983 | 2.065 | 2.14 | -1.797 | -1.687 |
| 6.80999999999973 | 1.984 | 2.065 | 2.141 | -1.798 | -1.688 |
| 6.81999999999973 | 1.985 | 2.066 | 2.141 | -1.799 | -1.689 |
| 6.82999999999973 | 1.986 | 2.067 | 2.142 | -1.8 | -1.69 |
| 6.83999999999973 | 1.987 | 2.068 | 2.143 | -1.801 | -1.692 |
| 6.84999999999973 | 1.987 | 2.068 | 2.144 | -1.802 | -1.693 |
| 6.85999999999973 | 1.988 | 2.069 | 2.144 | -1.803 | -1.694 |
| 6.86999999999973 | 1.989 | 2.07 | 2.145 | -1.804 | -1.695 |
| 6.879999999999728 | 1.99 | 2.071 | 2.146 | -1.805 | -1.696 |
| 6.889999999999728 | 1.991 | 2.072 | 2.147 | -1.806 | -1.697 |
| 6.899999999999728 | 1.992 | 2.072 | 2.147 | -1.807 | -1.698 |
| 6.909999999999728 | 1.992 | 2.073 | 2.148 | -1.808 | -1.7 |
| 6.919999999999728 | 1.993 | 2.074 | 2.149 | -1.809 | -1.701 |
| 6.929999999999727 | 1.994 | 2.075 | 2.149 | -1.81 | -1.702 |
| 6.939999999999727 | 1.995 | 2.075 | 2.15 | -1.811 | -1.703 |
| 6.949999999999727 | 1.996 | 2.076 | 2.151 | -1.812 | -1.704 |
| 6.959999999999727 | 1.997 | 2.077 | 2.152 | -1.813 | -1.705 |
| 6.969999999999727 | 1.997 | 2.078 | 2.152 | -1.814 | -1.707 |
| 6.979999999999726 | 1.998 | 2.079 | 2.153 | -1.815 | -1.708 |
| 6.989999999999726 | 1.999 | 2.079 | 2.154 | -1.816 | -1.709 |
| 6.999999999999726 | 2 | 2.08 | 2.154 | -1.817 | -1.71 |
| 7.009999999999726 | 2.001 | 2.081 | 2.155 | -1.818 | -1.711 |
| 7.019999999999726 | 2.002 | 2.082 | 2.156 | -1.819 | -1.712 |
| 7.029999999999725 | 2.002 | 2.082 | 2.157 | -1.82 | -1.713 |
| 7.039999999999725 | 2.003 | 2.083 | 2.157 | -1.821 | -1.715 |
| 7.049999999999725 | 2.004 | 2.084 | 2.158 | -1.822 | -1.716 |
| 7.059999999999725 | 2.005 | 2.085 | 2.159 | -1.823 | -1.717 |
| 7.069999999999724 | 2.006 | 2.085 | 2.159 | -1.824 | -1.718 |
| 7.079999999999724 | 2.007 | 2.086 | 2.16 | -1.825 | -1.719 |
| 7.089999999999724 | 2.007 | 2.087 | 2.161 | -1.826 | -1.72 |
| 7.099999999999724 | 2.008 | 2.088 | 2.162 | -1.827 | -1.721 |
| 7.109999999999724 | 2.009 | 2.089 | 2.162 | -1.828 | -1.722 |
| 7.119999999999724 | 2.01 | 2.089 | 2.163 | -1.829 | -1.724 |
| 7.129999999999724 | 2.011 | 2.09 | 2.164 | -1.83 | -1.725 |
| 7.139999999999723 | 2.012 | 2.091 | 2.164 | -1.831 | -1.726 |
| 7.149999999999723 | 2.012 | 2.092 | 2.165 | -1.832 | -1.727 |
| 7.159999999999723 | 2.013 | 2.092 | 2.166 | -1.833 | -1.728 |
| 7.169999999999723 | 2.014 | 2.093 | 2.167 | -1.834 | -1.729 |
| 7.179999999999722 | 2.015 | 2.094 | 2.167 | -1.835 | -1.73 |
| 7.189999999999722 | 2.016 | 2.095 | 2.168 | -1.836 | -1.731 |
| 7.199999999999722 | 2.017 | 2.095 | 2.169 | -1.837 | -1.732 |
| 7.209999999999721 | 2.017 | 2.096 | 2.169 | -1.838 | -1.734 |
| 7.219999999999721 | 2.018 | 2.097 | 2.17 | -1.839 | -1.735 |
| 7.229999999999721 | 2.019 | 2.098 | 2.171 | -1.84 | -1.736 |
| 7.23999999999972 | 2.02 | 2.098 | 2.172 | -1.841 | -1.737 |
| 7.24999999999972 | 2.021 | 2.099 | 2.172 | -1.842 | -1.738 |
| 7.25999999999972 | 2.021 | 2.1 | 2.173 | -1.843 | -1.739 |
| 7.26999999999972 | 2.022 | 2.101 | 2.174 | -1.844 | -1.74 |
| 7.27999999999972 | 2.023 | 2.101 | 2.174 | -1.845 | -1.741 |
| 7.28999999999972 | 2.024 | 2.102 | 2.175 | -1.846 | -1.742 |
| 7.29999999999972 | 2.025 | 2.103 | 2.176 | -1.847 | -1.744 |
| 7.30999999999972 | 2.026 | 2.104 | 2.176 | -1.848 | -1.745 |
| 7.31999999999972 | 2.026 | 2.104 | 2.177 | -1.849 | -1.746 |
| 7.329999999999719 | 2.027 | 2.105 | 2.178 | -1.85 | -1.747 |
| 7.33999999999972 | 2.028 | 2.106 | 2.179 | -1.851 | -1.748 |
| 7.349999999999719 | 2.029 | 2.107 | 2.179 | -1.852 | -1.749 |
| 7.359999999999719 | 2.03 | 2.107 | 2.18 | -1.853 | -1.75 |
| 7.369999999999718 | 2.03 | 2.108 | 2.181 | -1.854 | -1.751 |
| 7.379999999999718 | 2.031 | 2.109 | 2.181 | -1.855 | -1.752 |
| 7.389999999999718 | 2.032 | 2.11 | 2.182 | -1.856 | -1.753 |
| 7.399999999999718 | 2.033 | 2.11 | 2.183 | -1.857 | -1.754 |
| 7.409999999999717 | 2.034 | 2.111 | 2.183 | -1.858 | -1.755 |
| 7.419999999999717 | 2.034 | 2.112 | 2.184 | -1.859 | -1.757 |
| 7.429999999999717 | 2.035 | 2.113 | 2.185 | -1.86 | -1.758 |
| 7.439999999999717 | 2.036 | 2.113 | 2.186 | -1.86 | -1.759 |
| 7.449999999999716 | 2.037 | 2.114 | 2.186 | -1.861 | -1.76 |
| 7.459999999999716 | 2.038 | 2.115 | 2.187 | -1.862 | -1.761 |
| 7.469999999999716 | 2.038 | 2.116 | 2.188 | -1.863 | -1.762 |
| 7.479999999999716 | 2.039 | 2.116 | 2.188 | -1.864 | -1.763 |
| 7.489999999999715 | 2.04 | 2.117 | 2.189 | -1.865 | -1.764 |
| 7.499999999999715 | 2.041 | 2.118 | 2.19 | -1.866 | -1.765 |
| 7.509999999999715 | 2.042 | 2.119 | 2.19 | -1.867 | -1.766 |
| 7.519999999999715 | 2.042 | 2.119 | 2.191 | -1.868 | -1.767 |
| 7.529999999999715 | 2.043 | 2.12 | 2.192 | -1.869 | -1.768 |
| 7.539999999999714 | 2.044 | 2.121 | 2.193 | -1.87 | -1.769 |
| 7.549999999999714 | 2.045 | 2.122 | 2.193 | -1.871 | -1.771 |
| 7.559999999999714 | 2.046 | 2.122 | 2.194 | -1.872 | -1.772 |
| 7.569999999999714 | 2.046 | 2.123 | 2.195 | -1.873 | -1.773 |
| 7.579999999999714 | 2.047 | 2.124 | 2.195 | -1.874 | -1.774 |
| 7.589999999999714 | 2.048 | 2.125 | 2.196 | -1.875 | -1.775 |
| 7.599999999999714 | 2.049 | 2.125 | 2.197 | -1.876 | -1.776 |
| 7.609999999999713 | 2.05 | 2.126 | 2.197 | -1.877 | -1.777 |
| 7.619999999999713 | 2.05 | 2.127 | 2.198 | -1.878 | -1.778 |
| 7.629999999999713 | 2.051 | 2.128 | 2.199 | -1.879 | -1.779 |
| 7.639999999999713 | 2.052 | 2.128 | 2.199 | -1.88 | -1.78 |
| 7.649999999999712 | 2.053 | 2.129 | 2.2 | -1.881 | -1.781 |
| 7.659999999999712 | 2.054 | 2.13 | 2.201 | -1.881 | -1.782 |
| 7.669999999999712 | 2.054 | 2.13 | 2.202 | -1.882 | -1.783 |
| 7.679999999999712 | 2.055 | 2.131 | 2.202 | -1.883 | -1.784 |
| 7.689999999999712 | 2.056 | 2.132 | 2.203 | -1.884 | -1.785 |
| 7.699999999999711 | 2.057 | 2.133 | 2.204 | -1.885 | -1.786 |
| 7.709999999999711 | 2.057 | 2.133 | 2.204 | -1.886 | -1.787 |
| 7.719999999999711 | 2.058 | 2.134 | 2.205 | -1.887 | -1.788 |
| 7.729999999999711 | 2.059 | 2.135 | 2.206 | -1.888 | -1.789 |
| 7.73999999999971 | 2.06 | 2.136 | 2.206 | -1.889 | -1.79 |
| 7.74999999999971 | 2.061 | 2.136 | 2.207 | -1.89 | -1.792 |
| 7.75999999999971 | 2.061 | 2.137 | 2.208 | -1.891 | -1.793 |
| 7.76999999999971 | 2.062 | 2.138 | 2.208 | -1.892 | -1.794 |
| 7.77999999999971 | 2.063 | 2.139 | 2.209 | -1.893 | -1.795 |
| 7.78999999999971 | 2.064 | 2.139 | 2.21 | -1.894 | -1.796 |
| 7.79999999999971 | 2.065 | 2.14 | 2.21 | -1.895 | -1.797 |
| 7.80999999999971 | 2.065 | 2.141 | 2.211 | -1.895 | -1.798 |
| 7.819999999999709 | 2.066 | 2.141 | 2.212 | -1.896 | -1.799 |
| 7.829999999999709 | 2.067 | 2.142 | 2.212 | -1.897 | -1.8 |
| 7.839999999999708 | 2.068 | 2.143 | 2.213 | -1.898 | -1.801 |
| 7.849999999999708 | 2.068 | 2.144 | 2.214 | -1.899 | -1.802 |
| 7.859999999999708 | 2.069 | 2.144 | 2.215 | -1.9 | -1.803 |
| 7.869999999999708 | 2.07 | 2.145 | 2.215 | -1.901 | -1.804 |
| 7.879999999999707 | 2.071 | 2.146 | 2.216 | -1.902 | -1.805 |
| 7.889999999999707 | 2.072 | 2.147 | 2.217 | -1.903 | -1.806 |
| 7.899999999999707 | 2.072 | 2.147 | 2.217 | -1.904 | -1.807 |
| 7.909999999999707 | 2.073 | 2.148 | 2.218 | -1.905 | -1.808 |
| 7.919999999999706 | 2.074 | 2.149 | 2.219 | -1.906 | -1.809 |
| 7.929999999999706 | 2.075 | 2.149 | 2.219 | -1.907 | -1.81 |
| 7.939999999999706 | 2.075 | 2.15 | 2.22 | -1.907 | -1.811 |
| 7.949999999999706 | 2.076 | 2.151 | 2.221 | -1.908 | -1.812 |
| 7.959999999999705 | 2.077 | 2.152 | 2.221 | -1.909 | -1.813 |
| 7.969999999999705 | 2.078 | 2.152 | 2.222 | -1.91 | -1.814 |
| 7.979999999999705 | 2.079 | 2.153 | 2.223 | -1.911 | -1.815 |
| 7.989999999999705 | 2.079 | 2.154 | 2.223 | -1.912 | -1.816 |
| 7.999999999999705 | 2.08 | 2.154 | 2.224 | -1.913 | -1.817 |
| 8.009999999999703 | 2.081 | 2.155 | 2.225 | -1.914 | -1.818 |
| 8.019999999999705 | 2.082 | 2.156 | 2.225 | -1.915 | -1.819 |
| 8.029999999999704 | 2.082 | 2.157 | 2.226 | -1.916 | -1.82 |
| 8.039999999999704 | 2.083 | 2.157 | 2.227 | -1.917 | -1.821 |
| 8.049999999999704 | 2.084 | 2.158 | 2.227 | -1.917 | -1.822 |
| 8.059999999999704 | 2.085 | 2.159 | 2.228 | -1.918 | -1.823 |
| 8.069999999999704 | 2.085 | 2.159 | 2.229 | -1.919 | -1.824 |
| 8.079999999999703 | 2.086 | 2.16 | 2.229 | -1.92 | -1.825 |
| 8.089999999999703 | 2.087 | 2.161 | 2.23 | -1.921 | -1.826 |
| 8.099999999999701 | 2.088 | 2.162 | 2.231 | -1.922 | -1.827 |
| 8.109999999999703 | 2.089 | 2.162 | 2.231 | -1.923 | -1.828 |
| 8.119999999999703 | 2.089 | 2.163 | 2.232 | -1.924 | -1.829 |
| 8.129999999999702 | 2.09 | 2.164 | 2.233 | -1.925 | -1.83 |
| 8.139999999999702 | 2.091 | 2.164 | 2.233 | -1.926 | -1.831 |
| 8.1499999999997 | 2.092 | 2.165 | 2.234 | -1.926 | -1.832 |
| 8.1599999999997 | 2.092 | 2.166 | 2.235 | -1.927 | -1.833 |
| 8.1699999999997 | 2.093 | 2.167 | 2.235 | -1.928 | -1.834 |
| 8.1799999999997 | 2.094 | 2.167 | 2.236 | -1.929 | -1.835 |
| 8.1899999999997 | 2.095 | 2.168 | 2.237 | -1.93 | -1.836 |
| 8.1999999999997 | 2.095 | 2.169 | 2.237 | -1.931 | -1.837 |
| 8.2099999999997 | 2.096 | 2.169 | 2.238 | -1.932 | -1.838 |
| 8.2199999999997 | 2.097 | 2.17 | 2.239 | -1.933 | -1.839 |
| 8.2299999999997 | 2.098 | 2.171 | 2.239 | -1.934 | -1.84 |
| 8.2399999999997 | 2.098 | 2.172 | 2.24 | -1.935 | -1.841 |
| 8.2499999999997 | 2.099 | 2.172 | 2.241 | -1.935 | -1.842 |
| 8.2599999999997 | 2.1 | 2.173 | 2.241 | -1.936 | -1.843 |
| 8.2699999999997 | 2.101 | 2.174 | 2.242 | -1.937 | -1.844 |
| 8.2799999999997 | 2.101 | 2.174 | 2.243 | -1.938 | -1.845 |
| 8.289999999999697 | 2.102 | 2.175 | 2.243 | -1.939 | -1.846 |
| 8.299999999999699 | 2.103 | 2.176 | 2.244 | -1.94 | -1.847 |
| 8.309999999999699 | 2.104 | 2.176 | 2.245 | -1.941 | -1.848 |
| 8.319999999999698 | 2.104 | 2.177 | 2.245 | -1.942 | -1.849 |
| 8.329999999999698 | 2.105 | 2.178 | 2.246 | -1.943 | -1.85 |
| 8.339999999999698 | 2.106 | 2.179 | 2.247 | -1.943 | -1.851 |
| 8.349999999999698 | 2.107 | 2.179 | 2.247 | -1.944 | -1.852 |
| 8.359999999999697 | 2.107 | 2.18 | 2.248 | -1.945 | -1.853 |
| 8.369999999999697 | 2.108 | 2.181 | 2.249 | -1.946 | -1.854 |
| 8.379999999999695 | 2.109 | 2.181 | 2.249 | -1.947 | -1.855 |
| 8.389999999999697 | 2.11 | 2.182 | 2.25 | -1.948 | -1.856 |
| 8.399999999999697 | 2.11 | 2.183 | 2.251 | -1.949 | -1.857 |
| 8.409999999999696 | 2.111 | 2.183 | 2.251 | -1.95 | -1.858 |
| 8.419999999999696 | 2.112 | 2.184 | 2.252 | -1.95 | -1.859 |
| 8.429999999999694 | 2.113 | 2.185 | 2.253 | -1.951 | -1.86 |
| 8.439999999999696 | 2.113 | 2.186 | 2.253 | -1.952 | -1.86 |
| 8.449999999999696 | 2.114 | 2.186 | 2.254 | -1.953 | -1.861 |
| 8.459999999999695 | 2.115 | 2.187 | 2.255 | -1.954 | -1.862 |
| 8.469999999999695 | 2.116 | 2.188 | 2.255 | -1.955 | -1.863 |
| 8.479999999999693 | 2.116 | 2.188 | 2.256 | -1.956 | -1.864 |
| 8.489999999999695 | 2.117 | 2.189 | 2.257 | -1.957 | -1.865 |
| 8.499999999999694 | 2.118 | 2.19 | 2.257 | -1.957 | -1.866 |
| 8.509999999999694 | 2.119 | 2.19 | 2.258 | -1.958 | -1.867 |
| 8.519999999999694 | 2.119 | 2.191 | 2.258 | -1.959 | -1.868 |
| 8.529999999999694 | 2.12 | 2.192 | 2.259 | -1.96 | -1.869 |
| 8.539999999999694 | 2.121 | 2.193 | 2.26 | -1.961 | -1.87 |
| 8.549999999999693 | 2.122 | 2.193 | 2.26 | -1.962 | -1.871 |
| 8.55999999999969 | 2.122 | 2.194 | 2.261 | -1.963 | -1.872 |
| 8.56999999999969 | 2.123 | 2.195 | 2.262 | -1.964 | -1.873 |
| 8.57999999999969 | 2.124 | 2.195 | 2.262 | -1.964 | -1.874 |
| 8.58999999999969 | 2.125 | 2.196 | 2.263 | -1.965 | -1.875 |
| 8.59999999999969 | 2.125 | 2.197 | 2.264 | -1.966 | -1.876 |
| 8.60999999999969 | 2.126 | 2.197 | 2.264 | -1.967 | -1.877 |
| 8.61999999999969 | 2.127 | 2.198 | 2.265 | -1.968 | -1.878 |
| 8.62999999999969 | 2.128 | 2.199 | 2.266 | -1.969 | -1.879 |
| 8.63999999999969 | 2.128 | 2.199 | 2.266 | -1.97 | -1.88 |
| 8.64999999999969 | 2.129 | 2.2 | 2.267 | -1.97 | -1.881 |
| 8.65999999999969 | 2.13 | 2.201 | 2.268 | -1.971 | -1.881 |
| 8.66999999999969 | 2.13 | 2.202 | 2.268 | -1.972 | -1.882 |
| 8.67999999999969 | 2.131 | 2.202 | 2.269 | -1.973 | -1.883 |
| 8.68999999999969 | 2.132 | 2.203 | 2.27 | -1.974 | -1.884 |
| 8.69999999999969 | 2.133 | 2.204 | 2.27 | -1.975 | -1.885 |
| 8.70999999999969 | 2.133 | 2.204 | 2.271 | -1.976 | -1.886 |
| 8.71999999999969 | 2.134 | 2.205 | 2.271 | -1.976 | -1.887 |
| 8.72999999999969 | 2.135 | 2.206 | 2.272 | -1.977 | -1.888 |
| 8.73999999999969 | 2.136 | 2.206 | 2.273 | -1.978 | -1.889 |
| 8.74999999999969 | 2.136 | 2.207 | 2.273 | -1.979 | -1.89 |
| 8.759999999999687 | 2.137 | 2.208 | 2.274 | -1.98 | -1.891 |
| 8.769999999999689 | 2.138 | 2.208 | 2.275 | -1.981 | -1.892 |
| 8.779999999999688 | 2.139 | 2.209 | 2.275 | -1.981 | -1.893 |
| 8.789999999999688 | 2.139 | 2.21 | 2.276 | -1.982 | -1.894 |
| 8.799999999999686 | 2.14 | 2.21 | 2.277 | -1.983 | -1.895 |
| 8.809999999999688 | 2.141 | 2.211 | 2.277 | -1.984 | -1.895 |
| 8.819999999999688 | 2.141 | 2.212 | 2.278 | -1.985 | -1.896 |
| 8.829999999999687 | 2.142 | 2.212 | 2.279 | -1.986 | -1.897 |
| 8.839999999999687 | 2.143 | 2.213 | 2.279 | -1.987 | -1.898 |
| 8.849999999999685 | 2.144 | 2.214 | 2.28 | -1.987 | -1.899 |
| 8.859999999999687 | 2.144 | 2.215 | 2.28 | -1.988 | -1.9 |
| 8.869999999999687 | 2.145 | 2.215 | 2.281 | -1.989 | -1.901 |
| 8.879999999999686 | 2.146 | 2.216 | 2.282 | -1.99 | -1.902 |
| 8.889999999999686 | 2.147 | 2.217 | 2.282 | -1.991 | -1.903 |
| 8.899999999999684 | 2.147 | 2.217 | 2.283 | -1.992 | -1.904 |
| 8.909999999999686 | 2.148 | 2.218 | 2.284 | -1.992 | -1.905 |
| 8.919999999999686 | 2.149 | 2.219 | 2.284 | -1.993 | -1.906 |
| 8.929999999999685 | 2.149 | 2.219 | 2.285 | -1.994 | -1.907 |
| 8.939999999999685 | 2.15 | 2.22 | 2.286 | -1.995 | -1.907 |
| 8.949999999999685 | 2.151 | 2.221 | 2.286 | -1.996 | -1.908 |
| 8.959999999999685 | 2.152 | 2.221 | 2.287 | -1.997 | -1.909 |
| 8.969999999999684 | 2.152 | 2.222 | 2.288 | -1.997 | -1.91 |
| 8.979999999999684 | 2.153 | 2.223 | 2.288 | -1.998 | -1.911 |
| 8.989999999999682 | 2.154 | 2.223 | 2.289 | -1.999 | -1.912 |
| 8.999999999999684 | 2.154 | 2.224 | 2.289 | -2 | -1.913 |
| 9.009999999999684 | 2.155 | 2.225 | 2.29 | -2.001 | -1.914 |
| 9.019999999999683 | 2.156 | 2.225 | 2.291 | -2.002 | -1.915 |
| 9.029999999999683 | 2.157 | 2.226 | 2.291 | -2.002 | -1.916 |
| 9.039999999999681 | 2.157 | 2.227 | 2.292 | -2.003 | -1.917 |
| 9.049999999999683 | 2.158 | 2.227 | 2.293 | -2.004 | -1.917 |
| 9.05999999999968 | 2.159 | 2.228 | 2.293 | -2.005 | -1.918 |
| 9.06999999999968 | 2.159 | 2.229 | 2.294 | -2.006 | -1.919 |
| 9.07999999999968 | 2.16 | 2.229 | 2.295 | -2.007 | -1.92 |
| 9.08999999999968 | 2.161 | 2.23 | 2.295 | -2.007 | -1.921 |
| 9.09999999999968 | 2.162 | 2.231 | 2.296 | -2.008 | -1.922 |
| 9.10999999999968 | 2.162 | 2.231 | 2.296 | -2.009 | -1.923 |
| 9.11999999999968 | 2.163 | 2.232 | 2.297 | -2.01 | -1.924 |
| 9.12999999999968 | 2.164 | 2.233 | 2.298 | -2.011 | -1.925 |
| 9.13999999999968 | 2.164 | 2.233 | 2.298 | -2.012 | -1.926 |
| 9.14999999999968 | 2.165 | 2.234 | 2.299 | -2.012 | -1.926 |
| 9.15999999999968 | 2.166 | 2.235 | 2.3 | -2.013 | -1.927 |
| 9.16999999999968 | 2.167 | 2.235 | 2.3 | -2.014 | -1.928 |
| 9.17999999999968 | 2.167 | 2.236 | 2.301 | -2.015 | -1.929 |
| 9.18999999999968 | 2.168 | 2.237 | 2.301 | -2.016 | -1.93 |
| 9.19999999999968 | 2.169 | 2.237 | 2.302 | -2.017 | -1.931 |
| 9.20999999999968 | 2.169 | 2.238 | 2.303 | -2.017 | -1.932 |
| 9.21999999999968 | 2.17 | 2.239 | 2.303 | -2.018 | -1.933 |
| 9.229999999999677 | 2.171 | 2.239 | 2.304 | -2.019 | -1.934 |
| 9.239999999999679 | 2.172 | 2.24 | 2.305 | -2.02 | -1.935 |
| 9.249999999999678 | 2.172 | 2.241 | 2.305 | -2.021 | -1.935 |
| 9.259999999999678 | 2.173 | 2.241 | 2.306 | -2.021 | -1.936 |
| 9.269999999999678 | 2.174 | 2.242 | 2.306 | -2.022 | -1.937 |
| 9.279999999999678 | 2.174 | 2.243 | 2.307 | -2.023 | -1.938 |
| 9.289999999999678 | 2.175 | 2.243 | 2.308 | -2.024 | -1.939 |
| 9.299999999999677 | 2.176 | 2.244 | 2.308 | -2.025 | -1.94 |
| 9.309999999999677 | 2.176 | 2.245 | 2.309 | -2.026 | -1.941 |
| 9.319999999999675 | 2.177 | 2.245 | 2.31 | -2.026 | -1.942 |
| 9.329999999999677 | 2.178 | 2.246 | 2.31 | -2.027 | -1.943 |
| 9.339999999999677 | 2.179 | 2.247 | 2.311 | -2.028 | -1.943 |
| 9.349999999999676 | 2.179 | 2.247 | 2.311 | -2.029 | -1.944 |
| 9.359999999999676 | 2.18 | 2.248 | 2.312 | -2.03 | -1.945 |
| 9.369999999999674 | 2.181 | 2.249 | 2.313 | -2.03 | -1.946 |
| 9.379999999999676 | 2.181 | 2.249 | 2.313 | -2.031 | -1.947 |
| 9.389999999999675 | 2.182 | 2.25 | 2.314 | -2.032 | -1.948 |
| 9.399999999999675 | 2.183 | 2.251 | 2.315 | -2.033 | -1.949 |
| 9.409999999999675 | 2.183 | 2.251 | 2.315 | -2.034 | -1.95 |
| 9.419999999999675 | 2.184 | 2.252 | 2.316 | -2.034 | -1.95 |
| 9.429999999999675 | 2.185 | 2.253 | 2.316 | -2.035 | -1.951 |
| 9.439999999999674 | 2.186 | 2.253 | 2.317 | -2.036 | -1.952 |
| 9.449999999999674 | 2.186 | 2.254 | 2.318 | -2.037 | -1.953 |
| 9.459999999999672 | 2.187 | 2.255 | 2.318 | -2.038 | -1.954 |
| 9.469999999999674 | 2.188 | 2.255 | 2.319 | -2.038 | -1.955 |
| 9.479999999999674 | 2.188 | 2.256 | 2.32 | -2.039 | -1.956 |
| 9.489999999999673 | 2.189 | 2.257 | 2.32 | -2.04 | -1.957 |
| 9.499999999999673 | 2.19 | 2.257 | 2.321 | -2.041 | -1.957 |
| 9.509999999999671 | 2.19 | 2.258 | 2.321 | -2.042 | -1.958 |
| 9.519999999999673 | 2.191 | 2.258 | 2.322 | -2.042 | -1.959 |
| 9.529999999999673 | 2.192 | 2.259 | 2.323 | -2.043 | -1.96 |
| 9.539999999999672 | 2.193 | 2.26 | 2.323 | -2.044 | -1.961 |
| 9.549999999999672 | 2.193 | 2.26 | 2.324 | -2.045 | -1.962 |
| 9.55999999999967 | 2.194 | 2.261 | 2.325 | -2.046 | -1.963 |
| 9.56999999999967 | 2.195 | 2.262 | 2.325 | -2.046 | -1.964 |
| 9.57999999999967 | 2.195 | 2.262 | 2.326 | -2.047 | -1.964 |
| 9.58999999999967 | 2.196 | 2.263 | 2.326 | -2.048 | -1.965 |
| 9.59999999999967 | 2.197 | 2.264 | 2.327 | -2.049 | -1.966 |
| 9.60999999999967 | 2.197 | 2.264 | 2.328 | -2.05 | -1.967 |
| 9.61999999999967 | 2.198 | 2.265 | 2.328 | -2.05 | -1.968 |
| 9.62999999999967 | 2.199 | 2.266 | 2.329 | -2.051 | -1.969 |
| 9.63999999999967 | 2.199 | 2.266 | 2.329 | -2.052 | -1.97 |
| 9.64999999999967 | 2.2 | 2.267 | 2.33 | -2.053 | -1.97 |
| 9.65999999999967 | 2.201 | 2.268 | 2.331 | -2.054 | -1.971 |
| 9.66999999999967 | 2.202 | 2.268 | 2.331 | -2.054 | -1.972 |
| 9.67999999999967 | 2.202 | 2.269 | 2.332 | -2.055 | -1.973 |
| 9.689999999999667 | 2.203 | 2.27 | 2.332 | -2.056 | -1.974 |
| 9.699999999999669 | 2.204 | 2.27 | 2.333 | -2.057 | -1.975 |
| 9.709999999999669 | 2.204 | 2.271 | 2.334 | -2.057 | -1.976 |
| 9.719999999999668 | 2.205 | 2.271 | 2.334 | -2.058 | -1.976 |
| 9.729999999999668 | 2.206 | 2.272 | 2.335 | -2.059 | -1.977 |
| 9.739999999999666 | 2.206 | 2.273 | 2.336 | -2.06 | -1.978 |
| 9.749999999999668 | 2.207 | 2.273 | 2.336 | -2.061 | -1.979 |
| 9.759999999999668 | 2.208 | 2.274 | 2.337 | -2.061 | -1.98 |
| 9.769999999999667 | 2.208 | 2.275 | 2.337 | -2.062 | -1.981 |
| 9.779999999999667 | 2.209 | 2.275 | 2.338 | -2.063 | -1.981 |
| 9.789999999999665 | 2.21 | 2.276 | 2.339 | -2.064 | -1.982 |
| 9.799999999999667 | 2.21 | 2.277 | 2.339 | -2.065 | -1.983 |
| 9.809999999999667 | 2.211 | 2.277 | 2.34 | -2.065 | -1.984 |
| 9.819999999999666 | 2.212 | 2.278 | 2.34 | -2.066 | -1.985 |
| 9.829999999999666 | 2.212 | 2.279 | 2.341 | -2.067 | -1.986 |
| 9.839999999999664 | 2.213 | 2.279 | 2.342 | -2.068 | -1.987 |
| 9.849999999999666 | 2.214 | 2.28 | 2.342 | -2.068 | -1.987 |
| 9.859999999999665 | 2.215 | 2.28 | 2.343 | -2.069 | -1.988 |
| 9.869999999999665 | 2.215 | 2.281 | 2.343 | -2.07 | -1.989 |
| 9.879999999999663 | 2.216 | 2.282 | 2.344 | -2.071 | -1.99 |
| 9.889999999999665 | 2.217 | 2.282 | 2.345 | -2.072 | -1.991 |
| 9.899999999999665 | 2.217 | 2.283 | 2.345 | -2.072 | -1.992 |
| 9.909999999999664 | 2.218 | 2.284 | 2.346 | -2.073 | -1.992 |
| 9.919999999999664 | 2.219 | 2.284 | 2.347 | -2.074 | -1.993 |
| 9.929999999999662 | 2.219 | 2.285 | 2.347 | -2.075 | -1.994 |
| 9.939999999999664 | 2.22 | 2.286 | 2.348 | -2.075 | -1.995 |
| 9.949999999999664 | 2.221 | 2.286 | 2.348 | -2.076 | -1.996 |
| 9.95999999999966 | 2.221 | 2.287 | 2.349 | -2.077 | -1.997 |
| 9.96999999999966 | 2.222 | 2.288 | 2.35 | -2.078 | -1.997 |
| 9.97999999999966 | 2.223 | 2.288 | 2.35 | -2.079 | -1.998 |
| 9.98999999999966 | 2.223 | 2.289 | 2.351 | -2.079 | -1.999 |
| 9.99999999999966 | 2.224 | 2.289 | 2.351 | -2.08 | -2 |